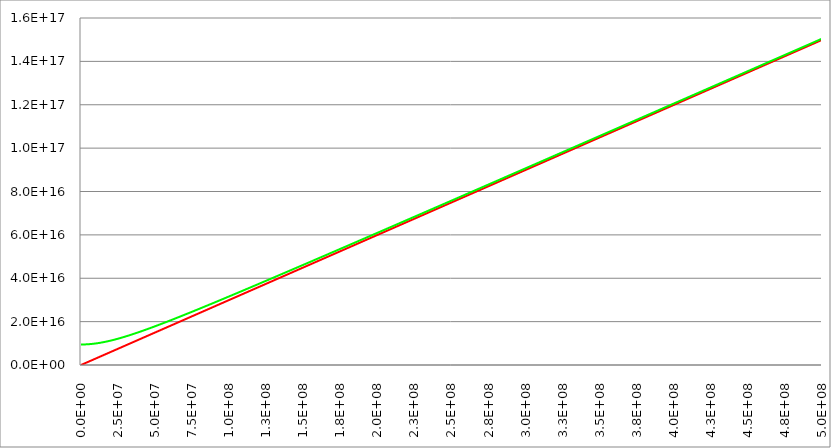
| Category | Series 1 | Series 0 | Series 2 |
|---|---|---|---|
| 0.0 | 0 | 9460730472580800 |  |
| 250000.0 | 74948114500000 | 9461036717467600 |  |
| 500000.0 | 149896229000000 | 9461955390777870 |  |
| 750000.0 | 224844343500000 | 9463486308522600 |  |
| 1000000.0 | 299792458000000 | 9465629164258070 |  |
| 1250000.0 | 374740572500000 | 9468383529392360 |  |
| 1500000.0 | 449688687000000 | 9471748853613310 |  |
| 1750000.0 | 524636801500000 | 9475724465437220 |  |
| 2000000.0 | 599584916000000 | 9480309572876750 |  |
| 2250000.0 | 674533030500000 | 9485503264226620 |  |
| 2500000.0 | 749481145000000 | 9491304508965320 |  |
| 2750000.0 | 824429259500000 | 9497712158770600 |  |
| 3000000.0 | 899377374000000 | 9504724948646660 |  |
| 3250000.0 | 974325488500000 | 9512341498160190 |  |
| 3500000.0 | 1049273603000000 | 9520560312782780 |  |
| 3750000.0 | 1124221717500000 | 9529379785336470 |  |
| 4000000.0 | 1199169832000000 | 9538798197539280 |  |
| 4250000.0 | 1274117946500000 | 9548813721647360 |  |
| 4500000.0 | 1349066061000000 | 9559424422190130 |  |
| 4750000.0 | 1424014175500000 | 9570628257794670 |  |
| 5000000.0 | 1498962290000000 | 9582423083095420 |  |
| 5250000.0 | 1573910404500000 | 9594806650725210 |  |
| 5500000.0 | 1648858519000000 | 9607776613383340 |  |
| 5750000.0 | 1723806633500000 | 9621330525976560 |  |
| 6000000.0 | 1798754748000000 | 9635465847828500 |  |
| 6250000.0 | 1873702862500000 | 9650179944953110 |  |
| 6500000.0 | 1948650977000000 | 9665470092387610 |  |
| 6750000.0 | 2023599091500000 | 9681333476580410 |  |
| 7000000.0 | 2098547206000000 | 9697767197829400 |  |
| 7250000.0 | 2173495320500000 | 9714768272765950 |  |
| 7500000.0 | 2248443435000000 | 9732333636880120 |  |
| 7750000.0 | 2323391549500000 | 9750460147082410 |  |
| 8000000.0 | 2398339664000000 | 9769144584297470 |  |
| 8250000.0 | 2473287778500000 | 9788383656085250 |  |
| 8500000.0 | 2548235893000000 | 9808173999285140 |  |
| 8750000.0 | 2623184007500000 | 9828512182678670 |  |
| 9000000.0 | 2698132122000000 | 9849394709666280 |  |
| 9250000.0 | 2773080236500000 | 9870818020954180 |  |
| 9500000.0 | 2848028351000000 | 9892778497246840 |  |
| 9750000.0 | 2922976465500000 | 9915272461941190 |  |
| 10000000.0 | 2997924580000000 | 9938296183818580 |  |
| 10250000.0 | 3072872694500000 | 9961845879730630 |  |
| 10500000.0 | 3147820809000000 | 9985917717275190 |  |
| 10750000.0 | 3222768923500000 | 10010507817459000 |  |
| 11000000.0 | 3297717038000000 | 10035612257343500 |  |
| 11250000.0 | 3372665152500000 | 10061227072670300 |  |
| 11500000.0 | 3447613267000000 | 10087348260463800 |  |
| 11750000.0 | 3522561381500000 | 10113971781607100 |  |
| 12000000.0 | 3597509496000000 | 10141093563389100 |  |
| 12250000.0 | 3672457610500000 | 10168709502019300 |  |
| 12500000.0 | 3747405725000000 | 10196815465109200 |  |
| 12750000.0 | 3822353839500000 | 10225407294115600 |  |
| 13000000.0 | 3897301954000000 | 10254480806746500 |  |
| 13250000.0 | 3972250068500000 | 10284031799324600 |  |
| 13500000.0 | 4047198183000000 | 10314056049108800 |  |
| 13750000.0 | 4122146297500000 | 10344549316570700 |  |
| 14000000.0 | 4197094412000000 | 10375507347624500 |  |
| 14250000.0 | 4272042526500000 | 10406925875810300 |  |
| 14500000.0 | 4346990641000000 | 10438800624426800 |  |
| 14750000.0 | 4421938755500000 | 10471127308615100 |  |
| 15000000.0 | 4496886870000000 | 10503901637390800 |  |
| 15250000.0 | 4571834984500000 | 10537119315623800 |  |
| 15500000.0 | 4646783099000000 | 10570776045966000 |  |
| 15750000.0 | 4721731213500000 | 10604867530724500 |  |
| 16000000.0 | 4796679328000000 | 10639389473682000 |  |
| 16250000.0 | 4871627442500000 | 10674337581861900 |  |
| 16500000.0 | 4946575557000000 | 10709707567239600 |  |
| 16750000.0 | 5021523671500000 | 10745495148398300 |  |
| 17000000.0 | 5096471786000000 | 10781696052130900 |  |
| 17250000.0 | 5171419900500000 | 10818306014986400 |  |
| 17500000.0 | 5246368015000000 | 10855320784762200 |  |
| 17750000.0 | 5321316129500000 | 10892736121941700 |  |
| 18000000.0 | 5396264244000000 | 10930547801078200 |  |
| 18250000.0 | 5471212358500000 | 10968751612125100 |  |
| 18500000.0 | 5546160473000000 | 11007343361712800 |  |
| 18750000.0 | 5621108587500000 | 11046318874373100 |  |
| 19000000.0 | 5696056702000000 | 11085673993711600 |  |
| 19250000.0 | 5771004816500000 | 11125404583529000 |  |
| 19500000.0 | 5845952931000000 | 11165506528891300 |  |
| 19750000.0 | 5920901045500000 | 11205975737150500 |  |
| 20000000.0 | 5995849160000000 | 11246808138916300 |  |
| 20250000.0 | 6070797274500000 | 11287999688979800 |  |
| 20500000.0 | 6145745389000000 | 11329546367189400 |  |
| 20750000.0 | 6220693503500000 | 11371444179281000 |  |
| 21000000.0 | 6295641618000000 | 11413689157662500 |  |
| 21250000.0 | 6370589732500000 | 11456277362154000 |  |
| 21500000.0 | 6445537847000000 | 11499204880685000 |  |
| 21750000.0 | 6520485961500000 | 11542467829948300 |  |
| 22000000.0 | 6595434076000000 | 11586062356014000 |  |
| 22250000.0 | 6670382190500000 | 11629984634902400 |  |
| 22500000.0 | 6745330305000000 | 11674230873117500 |  |
| 22750000.0 | 6820278419500000 | 11718797308143500 |  |
| 23000000.0 | 6895226534000000 | 11763680208903200 |  |
| 23250000.0 | 6970174648500000 | 11808875876181300 |  |
| 23500000.0 | 7045122763000000 | 11854380643012100 |  |
| 23750000.0 | 7120070877500000 | 11900190875034500 |  |
| 24000000.0 | 7195018992000000 | 11946302970813300 |  |
| 24250000.0 | 7269967106500000 | 11992713362129200 |  |
| 24500000.0 | 7344915221000000 | 12039418514238900 |  |
| 24750000.0 | 7419863335500000 | 12086414926104400 |  |
| 25000000.0 | 7494811450000000 | 12133699130595400 |  |
| 25250000.0 | 7569759564500000 | 12181267694663000 |  |
| 25500000.0 | 7644707679000000 | 12229117219487500 |  |
| 25750000.0 | 7719655793500000 | 12277244340600800 |  |
| 26000000.0 | 7794603908000000 | 12325645727984500 |  |
| 26250000.0 | 7869552022500000 | 12374318086144000 |  |
| 26500000.0 | 7944500137000000 | 12423258154160300 |  |
| 26750000.0 | 8019448251500000 | 12472462705720900 |  |
| 27000000.0 | 8094396366000000 | 12521928549128700 |  |
| 27250000.0 | 8169344480500000 | 12571652527292400 |  |
| 27500000.0 | 8244292595000000 | 12621631517697000 |  |
| 27750000.0 | 8319240709500000 | 12671862432356700 |  |
| 28000000.0 | 8394188824000000 | 12722342217750500 |  |
| 28250000.0 | 8469136938500000 | 12773067854741500 |  |
| 28500000.0 | 8544085053000000 | 12824036358480000 |  |
| 28750000.0 | 8619033167500000 | 12875244778292400 |  |
| 29000000.0 | 8693981282000000 | 12926690197555600 |  |
| 29250000.0 | 8768929396500000 | 12978369733558000 |  |
| 29500000.0 | 8843877511000000 | 13030280537348000 |  |
| 29750000.0 | 8918825625500000 | 13082419793570200 |  |
| 30000000.0 | 8993773740000000 | 13134784720290300 |  |
| 30250000.0 | 9068721854500000 | 13187372568809500 |  |
| 30500000.0 | 9143669969000000 | 13240180623468900 |  |
| 30750000.0 | 9218618083500000 | 13293206201443500 |  |
| 31000000.0 | 9293566198000000 | 13346446652528600 |  |
| 31250000.0 | 9368514312500000 | 13399899358916900 |  |
| 31500000.0 | 9443462427000000 | 13453561734968100 |  |
| 31750000.0 | 9518410541500000 | 13507431226971400 |  |
| 32000000.0 | 9593358656000000 | 13561505312900400 |  |
| 32250000.0 | 9668306770500000 | 13615781502163300 |  |
| 32500000.0 | 9743254885000000 | 13670257335345300 |  |
| 32750000.0 | 9818202999500000 | 13724930383947000 |  |
| 33000000.0 | 9893151114000000 | 13779798250117700 |  |
| 33250000.0 | 9968099228500000 | 13834858566383300 |  |
| 33500000.0 | 10043047343000000 | 13890108995371200 |  |
| 33750000.0 | 10117995457500000 | 13945547229530400 |  |
| 34000000.0 | 10192943572000000 | 14001170990849100 |  |
| 34250000.0 | 10267891686500000 | 14056978030568600 |  |
| 34500000.0 | 10342839801000000 | 14112966128894800 |  |
| 34750000.0 | 10417787915500000 | 14169133094707300 |  |
| 35000000.0 | 10492736030000000 | 14225476765266500 |  |
| 35250000.0 | 10567684144500000 | 14281995005918500 |  |
| 35500000.0 | 10642632259000000 | 14338685709798900 |  |
| 35750000.0 | 10717580373500000 | 14395546797535700 |  |
| 36000000.0 | 10792528488000000 | 14452576216949900 |  |
| 36250000.0 | 10867476602500000 | 14509771942757100 |  |
| 36500000.0 | 10942424717000000 | 14567131976267300 |  |
| 36750000.0 | 11017372831500000 | 14624654345084800 |  |
| 37000000.0 | 11092320946000000 | 14682337102808300 |  |
| 37250000.0 | 11167269060500000 | 14740178328730900 |  |
| 37500000.0 | 11242217175000000 | 14798176127540000 |  |
| 37750000.0 | 11317165289500000 | 14856328629018600 |  |
| 38000000.0 | 11392113404000000 | 14914633987746500 |  |
| 38250000.0 | 11467061518500000 | 14973090382802500 |  |
| 38500000.0 | 11542009633000000 | 15031696017467700 |  |
| 38750000.0 | 11616957747500000 | 15090449118929800 |  |
| 39000000.0 | 11691905862000000 | 15149347937988800 |  |
| 39250000.0 | 11766853976500000 | 15208390748763700 |  |
| 39500000.0 | 11841802091000000 | 15267575848401200 |  |
| 39750000.0 | 11916750205500000 | 15326901556785500 |  |
| 40000000.0 | 11991698320000000 | 15386366216250100 |  |
| 40250000.0 | 12066646434500000 | 15445968191291400 |  |
| 40500000.0 | 12141594549000000 | 15505705868284000 |  |
| 40750000.0 | 12216542663500000 | 15565577655198200 |  |
| 41000000.0 | 12291490778000000 | 15625581981319400 |  |
| 41250000.0 | 12366438892500000 | 15685717296969700 |  |
| 41500000.0 | 12441387007000000 | 15745982073231600 |  |
| 41750000.0 | 12516335121500000 | 15806374801674200 |  |
| 42000000.0 | 12591283236000000 | 15866893994081400 |  |
| 42250000.0 | 12666231350500000 | 15927538182182600 |  |
| 42500000.0 | 12741179465000000 | 15988305917386000 |  |
| 42750000.0 | 12816127579500000 | 16049195770514200 |  |
| 43000000.0 | 12891075694000000 | 16110206331542100 |  |
| 43250000.0 | 12966023808500000 | 16171336209337700 |  |
| 43500000.0 | 13040971923000000 | 16232584031405500 |  |
| 43750000.0 | 13115920037500000 | 16293948443631900 |  |
| 44000000.0 | 13190868152000000 | 16355428110034100 |  |
| 44250000.0 | 13265816266500000 | 16417021712510800 |  |
| 44500000.0 | 13340764381000000 | 16478727950596300 |  |
| 44750000.0 | 13415712495500000 | 16540545541216900 |  |
| 45000000.0 | 13490660610000000 | 16602473218449600 |  |
| 45250000.0 | 13565608724500000 | 16664509733284900 |  |
| 45500000.0 | 13640556839000000 | 16726653853390400 |  |
| 45750000.0 | 13715504953500000 | 16788904362878500 |  |
| 46000000.0 | 13790453068000000 | 16851260062076800 |  |
| 46250000.0 | 13865401182500000 | 16913719767300200 |  |
| 46500000.0 | 13940349297000000 | 16976282310626600 |  |
| 46750000.0 | 14015297411500000 | 17038946539675600 |  |
| 47000000.0 | 14090245526000000 | 17101711317388700 |  |
| 47250000.0 | 14165193640500000 | 17164575521813200 |  |
| 47500000.0 | 14240141755000000 | 17227538045889000 |  |
| 47750000.0 | 14315089869500000 | 17290597797237000 |  |
| 48000000.0 | 14390037984000000 | 17353753697951200 |  |
| 48250000.0 | 14464986098500000 | 17417004684392900 |  |
| 48500000.0 | 14539934213000000 | 17480349706988200 |  |
| 48750000.0 | 14614882327500000 | 17543787730027200 |  |
| 49000000.0 | 14689830442000000 | 17607317731466800 |  |
| 49250000.0 | 14764778556500000 | 17670938702735500 |  |
| 49500000.0 | 14839726671000000 | 17734649648540800 |  |
| 49750000.0 | 14914674785500000 | 17798449586679700 |  |
| 50000000.0 | 14989622900000000 | 17862337547851400 |  |
| 50250000.0 | 15064571014500000 | 17926312575472500 |  |
| 50500000.0 | 15139519129000000 | 17990373725494400 |  |
| 50750000.0 | 15214467243500000 | 18054520066224600 |  |
| 51000000.0 | 15289415358000000 | 18118750678148500 |  |
| 51250000.0 | 15364363472500000 | 18183064653755100 |  |
| 51500000.0 | 15439311587000000 | 18247461097364700 |  |
| 51750000.0 | 15514259701500000 | 18311939124959000 |  |
| 52000000.0 | 15589207816000000 | 18376497864013400 |  |
| 52250000.0 | 15664155930500000 | 18441136453332100 |  |
| 52500000.0 | 15739104045000000 | 18505854042885300 |  |
| 52750000.0 | 15814052159500000 | 18570649793648500 |  |
| 53000000.0 | 15889000274000000 | 18635522877444500 |  |
| 53250000.0 | 15963948388500000 | 18700472476787600 |  |
| 53500000.0 | 16038896503000000 | 18765497784729700 |  |
| 53750000.0 | 16113844617500000 | 18830598004708800 |  |
| 54000000.0 | 16188792732000000 | 18895772350400300 |  |
| 54250000.0 | 16263740846500000 | 18961020045569100 |  |
| 54500000.0 | 16338688961000000 | 19026340323925400 |  |
| 54750000.0 | 16413637075500000 | 19091732428981600 |  |
| 55000000.0 | 16488585190000000 | 19157195613911200 |  |
| 55250000.0 | 16563533304500000 | 19222729141410900 |  |
| 55500000.0 | 16638481419000000 | 19288332283563300 |  |
| 55750000.0 | 16713429533500000 | 19354004321702800 |  |
| 56000000.0 | 16788377648000000 | 19419744546282500 |  |
| 56250000.0 | 16863325762500000 | 19485552256743900 |  |
| 56500000.0 | 16938273877000000 | 19551426761388300 |  |
| 56750000.0 | 17013221991500000 | 19617367377249400 |  |
| 57000000.0 | 17088170106000000 | 19683373429969100 |  |
| 57250000.0 | 17163118220500000 | 19749444253674100 |  |
| 57500000.0 | 17238066335000000 | 19815579190854500 |  |
| 57750000.0 | 17313014449500000 | 19881777592244900 |  |
| 58000000.0 | 17387962564000000 | 19948038816706400 |  |
| 58250000.0 | 17462910678500000 | 20014362231110800 |  |
| 58500000.0 | 17537858793000000 | 20080747210226800 |  |
| 58750000.0 | 17612806907500000 | 20147193136607100 |  |
| 59000000.0 | 17687755022000000 | 20213699400478300 |  |
| 59250000.0 | 17762703136500000 | 20280265399631200 |  |
| 59500000.0 | 17837651251000000 | 20346890539314000 |  |
| 59750000.0 | 17912599365500000 | 20413574232126400 |  |
| 60000000.0 | 17987547480000000 | 20480315897915000 |  |
| 60250000.0 | 18062495594500000 | 20547114963671200 |  |
| 60500000.0 | 18137443709000000 | 20613970863430100 |  |
| 60750000.0 | 18212391823500000 | 20680883038170700 |  |
| 61000000.0 | 18287339938000000 | 20747850935718200 |  |
| 61250000.0 | 18362288052500000 | 20814874010647300 |  |
| 61500000.0 | 18437236167000000 | 20881951724187000 |  |
| 61750000.0 | 18512184281500000 | 20949083544127300 |  |
| 62000000.0 | 18587132396000000 | 21016268944727000 |  |
| 62250000.0 | 18662080510500000 | 21083507406622500 |  |
| 62500000.0 | 18737028625000000 | 21150798416738600 |  |
| 62750000.0 | 18811976739500000 | 21218141468200800 |  |
| 63000000.0 | 18886924854000000 | 21285536060247700 |  |
| 63250000.0 | 18961872968500000 | 21352981698146500 |  |
| 63500000.0 | 19036821083000000 | 21420477893108400 |  |
| 63750000.0 | 19111769197500000 | 21488024162205600 |  |
| 64000000.0 | 19186717312000000 | 21555620028290300 |  |
| 64250000.0 | 19261665426500000 | 21623265019913500 |  |
| 64500000.0 | 19336613541000000 | 21690958671246900 |  |
| 64750000.0 | 19411561655500000 | 21758700522004100 |  |
| 65000000.0 | 19486509770000000 | 21826490117364200 |  |
| 65250000.0 | 19561457884500000 | 21894327007896200 |  |
| 65500000.0 | 19636405999000000 | 21962210749484700 |  |
| 65750000.0 | 19711354113500000 | 22030140903256200 |  |
| 66000000.0 | 19786302228000000 | 22098117035507300 |  |
| 66250000.0 | 19861250342500000 | 22166138717633300 |  |
| 66500000.0 | 19936198457000000 | 22234205526058400 |  |
| 66750000.0 | 20011146571500000 | 22302317042166700 |  |
| 67000000.0 | 20086094686000000 | 22370472852233900 |  |
| 67250000.0 | 20161042800500000 | 22438672547360900 |  |
| 67500000.0 | 20235990915000000 | 22506915723407600 |  |
| 67750000.0 | 20310939029500000 | 22575201980928200 |  |
| 68000000.0 | 20385887144000000 | 22643530925107100 |  |
| 68250000.0 | 20460835258500000 | 22711902165695900 |  |
| 68500000.0 | 20535783373000000 | 22780315316951800 |  |
| 68750000.0 | 20610731487500000 | 22848769997575900 |  |
| 69000000.0 | 20685679602000000 | 22917265830653700 |  |
| 69250000.0 | 20760627716500000 | 22985802443595200 |  |
| 69500000.0 | 20835575831000000 | 23054379468077200 |  |
| 69750000.0 | 20910523945500000 | 23122996539985300 |  |
| 70000000.0 | 20985472060000000 | 23191653299357400 |  |
| 70250000.0 | 21060420174500000 | 23260349390328300 |  |
| 70500000.0 | 21135368289000000 | 23329084461074200 |  |
| 70750000.0 | 21210316403500000 | 23397858163758800 |  |
| 71000000.0 | 21285264518000000 | 23466670154480400 |  |
| 71250000.0 | 21360212632500000 | 23535520093218600 |  |
| 71500000.0 | 21435160747000000 | 23604407643783400 |  |
| 71750000.0 | 21510108861500000 | 23673332473763600 |  |
| 72000000.0 | 21585056976000000 | 23742294254476900 |  |
| 72250000.0 | 21660005090500000 | 23811292660920500 |  |
| 72500000.0 | 21734953205000000 | 23880327371722200 |  |
| 72750000.0 | 21809901319500000 | 23949398069092800 |  |
| 73000000.0 | 21884849434000000 | 24018504438778100 |  |
| 73250000.0 | 21959797548500000 | 24087646170013200 |  |
| 73500000.0 | 22034745663000000 | 24156822955475900 |  |
| 73750000.0 | 22109693777500000 | 24226034491241900 |  |
| 74000000.0 | 22184641892000000 | 24295280476740100 |  |
| 74250000.0 | 22259590006500000 | 24364560614708800 |  |
| 74500000.0 | 22334538121000000 | 24433874611152400 |  |
| 74750000.0 | 22409486235500000 | 24503222175298800 |  |
| 75000000.0 | 22484434350000000 | 24572603019557600 |  |
| 75250000.0 | 22559382464500000 | 24642016859478300 |  |
| 75500000.0 | 22634330579000000 | 24711463413710300 |  |
| 75750000.0 | 22709278693500000 | 24780942403961900 |  |
| 76000000.0 | 22784226808000000 | 24850453554961500 |  |
| 76250000.0 | 22859174922500000 | 24919996594418000 |  |
| 76500000.0 | 22934123037000000 | 24989571252982800 |  |
| 76750000.0 | 23009071151500000 | 25059177264211700 |  |
| 77000000.0 | 23084019266000000 | 25128814364527900 |  |
| 77250000.0 | 23158967380500000 | 25198482293184900 |  |
| 77500000.0 | 23233915495000000 | 25268180792230400 |  |
| 77750000.0 | 23308863609500000 | 25337909606470600 |  |
| 78000000.0 | 23383811724000000 | 25407668483435400 |  |
| 78250000.0 | 23458759838500000 | 25477457173342900 |  |
| 78500000.0 | 23533707953000000 | 25547275429066000 |  |
| 78750000.0 | 23608656067500000 | 25617123006098300 |  |
| 79000000.0 | 23683604182000000 | 25686999662521200 |  |
| 79250000.0 | 23758552296500000 | 25756905158970900 |  |
| 79500000.0 | 23833500411000000 | 25826839258606400 |  |
| 79750000.0 | 23908448525500000 | 25896801727077400 |  |
| 80000000.0 | 23983396640000000 | 25966792332493400 |  |
| 80250000.0 | 24058344754500000 | 26036810845392700 |  |
| 80500000.0 | 24133292869000000 | 26106857038711700 |  |
| 80750000.0 | 24208240983500000 | 26176930687755100 |  |
| 81000000.0 | 24283189098000000 | 26247031570166400 |  |
| 81250000.0 | 24358137212500000 | 26317159465898800 |  |
| 81500000.0 | 24433085327000000 | 26387314157186200 |  |
| 81750000.0 | 24508033441500000 | 26457495428514900 |  |
| 82000000.0 | 24582981556000000 | 26527703066596100 |  |
| 82250000.0 | 24657929670500000 | 26597936860337900 |  |
| 82500000.0 | 24732877785000000 | 26668196600818400 |  |
| 82750000.0 | 24807825899500000 | 26738482081258800 |  |
| 83000000.0 | 24882774014000000 | 26808793096997200 |  |
| 83250000.0 | 24957722128500000 | 26879129445462600 |  |
| 83500000.0 | 25032670243000000 | 26949490926148900 |  |
| 83750000.0 | 25107618357500000 | 27019877340590200 |  |
| 84000000.0 | 25182566472000000 | 27090288492335300 |  |
| 84250000.0 | 25257514586500000 | 27160724186923600 |  |
| 84500000.0 | 25332462701000000 | 27231184231860600 |  |
| 84750000.0 | 25407410815500000 | 27301668436594000 |  |
| 85000000.0 | 25482358930000000 | 27372176612490300 |  |
| 85250000.0 | 25557307044500000 | 27442708572811300 |  |
| 85500000.0 | 25632255159000000 | 27513264132691800 |  |
| 85750000.0 | 25707203273500000 | 27583843109116100 |  |
| 86000000.0 | 25782151388000000 | 27654445320896400 |  |
| 86250000.0 | 25857099502500000 | 27725070588650700 |  |
| 86500000.0 | 25932047617000000 | 27795718734781100 |  |
| 86750000.0 | 26006995731500000 | 27866389583452200 |  |
| 87000000.0 | 26081943846000000 | 27937082960570400 |  |
| 87250000.0 | 26156891960500000 | 28007798693762800 |  |
| 87500000.0 | 26231840075000000 | 28078536612357100 |  |
| 87750000.0 | 26306788189500000 | 28149296547360900 |  |
| 88000000.0 | 26381736304000000 | 28220078331442200 |  |
| 88250000.0 | 26456684418500000 | 28290881798909300 |  |
| 88500000.0 | 26531632533000000 | 28361706785691900 |  |
| 88750000.0 | 26606580647500000 | 28432553129321400 |  |
| 89000000.0 | 26681528762000000 | 28503420668912600 |  |
| 89250000.0 | 26756476876500000 | 28574309245144700 |  |
| 89500000.0 | 26831424991000000 | 28645218700243100 |  |
| 89750000.0 | 26906373105500000 | 28716148877961100 |  |
| 90000000.0 | 26981321220000000 | 28787099623562200 |  |
| 90250000.0 | 27056269334500000 | 28858070783802600 |  |
| 90500000.0 | 27131217449000000 | 28929062206913500 |  |
| 90750000.0 | 27206165563500000 | 29000073742584100 |  |
| 91000000.0 | 27281113678000000 | 29071105241944700 |  |
| 91250000.0 | 27356061792500000 | 29142156557549900 |  |
| 91500000.0 | 27431009907000000 | 29213227543362200 |  |
| 91750000.0 | 27505958021500000 | 29284318054735700 |  |
| 92000000.0 | 27580906136000000 | 29355427948400200 |  |
| 92250000.0 | 27655854250500000 | 29426557082445100 |  |
| 92500000.0 | 27730802365000000 | 29497705316304100 |  |
| 92750000.0 | 27805750479500000 | 29568872510739600 |  |
| 93000000.0 | 27880698594000000 | 29640058527827500 |  |
| 93250000.0 | 27955646708500000 | 29711263230942200 |  |
| 93500000.0 | 28030594823000000 | 29782486484742000 |  |
| 93750000.0 | 28105542937500000 | 29853728155154100 |  |
| 94000000.0 | 28180491052000000 | 29924988109360600 |  |
| 94250000.0 | 28255439166500000 | 29996266215784000 |  |
| 94500000.0 | 28330387281000000 | 30067562344073300 |  |
| 94750000.0 | 28405335395500000 | 30138876365090200 |  |
| 95000000.0 | 28480283510000000 | 30210208150895000 |  |
| 95250000.0 | 28555231624500000 | 30281557574733700 |  |
| 95500000.0 | 28630179739000000 | 30352924511024500 |  |
| 95750000.0 | 28705127853500000 | 30424308835344300 |  |
| 96000000.0 | 28780075968000000 | 30495710424416100 |  |
| 96250000.0 | 28855024082500000 | 30567129156096200 |  |
| 96500000.0 | 28929972197000000 | 30638564909361400 |  |
| 96750000.0 | 29004920311500000 | 30710017564296600 |  |
| 97000000.0 | 29079868426000000 | 30781487002082300 |  |
| 97250000.0 | 29154816540500000 | 30852973104982900 |  |
| 97500000.0 | 29229764655000000 | 30924475756334200 |  |
| 97750000.0 | 29304712769500000 | 30995994840531800 |  |
| 98000000.0 | 29379660884000000 | 31067530243019600 |  |
| 98250000.0 | 29454608998500000 | 31139081850277700 |  |
| 98500000.0 | 29529557113000000 | 31210649549811700 |  |
| 98750000.0 | 29604505227500000 | 31282233230140800 |  |
| 99000000.0 | 29679453342000000 | 31353832780787300 |  |
| 99250000.0 | 29754401456500000 | 31425448092265000 |  |
| 99500000.0 | 29829349571000000 | 31497079056069000 |  |
| 99750000.0 | 29904297685500000 | 31568725564664600 |  |
| 100000000.0 | 29979245800000000 | 31640387511476900 |  |
| 100250000.0 | 30054193914500000 | 31712064790880400 |  |
| 100500000.0 | 30129142029000000 | 31783757298188500 |  |
| 100750000.0 | 30204090143500000 | 31855464929643800 |  |
| 101000000.0 | 30279038258000000 | 31927187582407600 |  |
| 101250000.0 | 30353986372500000 | 31998925154550200 |  |
| 101500000.0 | 30428934487000000 | 32070677545041200 |  |
| 101750000.0 | 30503882601500000 | 32142444653739800 |  |
| 102000000.0 | 30578830716000000 | 32214226381385100 |  |
| 102250000.0 | 30653778830500000 | 32286022629586800 |  |
| 102500000.0 | 30728726945000000 | 32357833300816100 |  |
| 102750000.0 | 30803675059500000 | 32429658298396100 |  |
| 103000000.0 | 30878623174000000 | 32501497526493200 |  |
| 103250000.0 | 30953571288500000 | 32573350890107800 |  |
| 103500000.0 | 31028519403000000 | 32645218295065500 |  |
| 103750000.0 | 31103467517500000 | 32717099648008600 |  |
| 104000000.0 | 31178415632000000 | 32788994856387200 |  |
| 104250000.0 | 31253363746500000 | 32860903828450800 |  |
| 104500000.0 | 31328311861000000 | 32932826473239800 |  |
| 104750000.0 | 31403259975500000 | 33004762700577600 |  |
| 105000000.0 | 31478208090000000 | 33076712421061500 |  |
| 105250000.0 | 31553156204500000 | 33148675546055800 |  |
| 105500000.0 | 31628104319000000 | 33220651987682500 |  |
| 105750000.0 | 31703052433500000 | 33292641658814400 |  |
| 106000000.0 | 31778000548000000 | 33364644473067000 |  |
| 106250000.0 | 31852948662500000 | 33436660344790200 |  |
| 106500000.0 | 31927896777000000 | 33508689189061800 |  |
| 106750000.0 | 32002844891500000 | 33580730921678800 |  |
| 107000000.0 | 32077793006000000 | 33652785459150700 |  |
| 107250000.0 | 32152741120500000 | 33724852718691900 |  |
| 107500000.0 | 32227689235000000 | 33796932618214600 |  |
| 107750000.0 | 32302637349500000 | 33869025076321400 |  |
| 108000000.0 | 32377585464000000 | 33941130012298100 |  |
| 108250000.0 | 32452533578500000 | 34013247346107100 |  |
| 108500000.0 | 32527481693000000 | 34085376998380400 |  |
| 108750000.0 | 32602429807500000 | 34157518890412300 |  |
| 109000000.0 | 32677377922000000 | 34229672944153300 |  |
| 109250000.0 | 32752326036500000 | 34301839082202900 |  |
| 109500000.0 | 32827274151000000 | 34374017227803300 |  |
| 109750000.0 | 32902222265500000 | 34446207304832600 |  |
| 110000000.0 | 32977170380000000 | 34518409237799000 |  |
| 110250000.0 | 33052118494500000 | 34590622951833500 |  |
| 110500000.0 | 33127066609000000 | 34662848372684300 |  |
| 110750000.0 | 33202014723500000 | 34735085426710400 |  |
| 111000000.0 | 33276962838000000 | 34807334040875500 |  |
| 111250000.0 | 33351910952500000 | 34879594142741600 |  |
| 111500000.0 | 33426859067000000 | 34951865660463600 |  |
| 111750000.0 | 33501807181500000 | 35024148522782900 |  |
| 112000000.0 | 33576755296000000 | 35096442659021600 |  |
| 112250000.0 | 33651703410500000 | 35168747999077000 |  |
| 112500000.0 | 33726651525000000 | 35241064473415600 |  |
| 112750000.0 | 33801599639500000 | 35313392013067400 |  |
| 113000000.0 | 33876547754000000 | 35385730549620600 |  |
| 113250000.0 | 33951495868500000 | 35458080015215800 |  |
| 113500000.0 | 34026443983000000 | 35530440342540800 |  |
| 113750000.0 | 34101392097500000 | 35602811464824900 |  |
| 114000000.0 | 34176340212000000 | 35675193315833900 |  |
| 114250000.0 | 34251288326500000 | 35747585829864300 |  |
| 114500000.0 | 34326236441000000 | 35819988941738900 |  |
| 114750000.0 | 34401184555500000 | 35892402586800800 |  |
| 115000000.0 | 34476132670000000 | 35964826700909000 |  |
| 115250000.0 | 34551080784500000 | 36037261220432896 |  |
| 115500000.0 | 34626028899000000 | 36109706082247400 |  |
| 115750000.0 | 34700977013500000 | 36182161223728304 |  |
| 116000000.0 | 34775925128000000 | 36254626582747000 |  |
| 116250000.0 | 34850873242500000 | 36327102097666000 |  |
| 116500000.0 | 34925821357000000 | 36399587707334096 |  |
| 116750000.0 | 35000769471500000 | 36472083351081400 |  |
| 117000000.0 | 35075717586000000 | 36544588968715104 |  |
| 117250000.0 | 35150665700500000 | 36617104500514800 |  |
| 117500000.0 | 35225613815000000 | 36689629887227600 |  |
| 117750000.0 | 35300561929500000 | 36762165070064096 |  |
| 118000000.0 | 35375510044000000 | 36834709990693504 |  |
| 118250000.0 | 35450458158500000 | 36907264591239800 |  |
| 118500000.0 | 35525406273000000 | 36979828814276704 |  |
| 118750000.0 | 35600354387500000 | 37052402602824096 |  |
| 119000000.0 | 35675302502000000 | 37124985900343200 |  |
| 119250000.0 | 35750250616500000 | 37197578650732704 |  |
| 119500000.0 | 35825198731000000 | 37270180798324400 |  |
| 119750000.0 | 35900146845500000 | 37342792287879504 |  |
| 120000000.0 | 35975094960000000 | 37415413064584096 |  |
| 120250000.0 | 36050043074500000 | 37488043074045200 |  |
| 120500000.0 | 36124991189000000 | 37560682262287200 |  |
| 120750000.0 | 36199939303500000 | 37633330575747504 |  |
| 121000000.0 | 36274887418000000 | 37705987961272896 |  |
| 121250000.0 | 36349835532500000 | 37778654366115400 |  |
| 121500000.0 | 36424783647000000 | 37851329737929000 |  |
| 121750000.0 | 36499731761500000 | 37924014024765296 |  |
| 122000000.0 | 36574679876000000 | 37996707175070400 |  |
| 122250000.0 | 36649627990500000 | 38069409137680600 |  |
| 122500000.0 | 36724576105000000 | 38142119861819504 |  |
| 122750000.0 | 36799524219500000 | 38214839297093504 |  |
| 123000000.0 | 36874472334000000 | 38287567393489104 |  |
| 123250000.0 | 36949420448500000 | 38360304101369104 |  |
| 123500000.0 | 37024368563000000 | 38433049371468704 |  |
| 123750000.0 | 37099316677500000 | 38505803154892896 |  |
| 124000000.0 | 37174264792000000 | 38578565403112200 |  |
| 124250000.0 | 37249212906500000 | 38651336067959800 |  |
| 124500000.0 | 37324161021000000 | 38724115101628400 |  |
| 124750000.0 | 37399109135500000 | 38796902456666304 |  |
| 125000000.0 | 37474057250000000 | 38869698085974600 |  |
| 125250000.0 | 37549005364500000 | 38942501942804000 |  |
| 125500000.0 | 37623953479000000 | 39015313980751296 |  |
| 125750000.0 | 37698901593500000 | 39088134153756704 |  |
| 126000000.0 | 37773849708000000 | 39160962416100096 |  |
| 126250000.0 | 37848797822500000 | 39233798722398600 |  |
| 126500000.0 | 37923745937000000 | 39306643027603000 |  |
| 126750000.0 | 37998694051500000 | 39379495286995200 |  |
| 127000000.0 | 38073642166000000 | 39452355456184704 |  |
| 127250000.0 | 38148590280500000 | 39525223491106096 |  |
| 127500000.0 | 38223538395000000 | 39598099348016096 |  |
| 127750000.0 | 38298486509500000 | 39670982983490200 |  |
| 128000000.0 | 38373434624000000 | 39743874354420496 |  |
| 128250000.0 | 38448382738500000 | 39816773418012304 |  |
| 128500000.0 | 38523330853000000 | 39889680131781600 |  |
| 128750000.0 | 38598278967500000 | 39962594453552304 |  |
| 129000000.0 | 38673227082000000 | 40035516341453200 |  |
| 129250000.0 | 38748175196500000 | 40108445753915800 |  |
| 129500000.0 | 38823123311000000 | 40181382649671000 |  |
| 129750000.0 | 38898071425500000 | 40254326987747000 |  |
| 130000000.0 | 38973019540000000 | 40327278727466304 |  |
| 130250000.0 | 39047967654500000 | 40400237828443200 |  |
| 130500000.0 | 39122915769000000 | 40473204250581296 |  |
| 130750000.0 | 39197863883500000 | 40546177954071000 |  |
| 131000000.0 | 39272811998000000 | 40619158899386496 |  |
| 131250000.0 | 39347760112500000 | 40692147047284096 |  |
| 131500000.0 | 39422708227000000 | 40765142358799104 |  |
| 131750000.0 | 39497656341500000 | 40838144795243696 |  |
| 132000000.0 | 39572604456000000 | 40911154318204200 |  |
| 132250000.0 | 39647552570500000 | 40984170889539104 |  |
| 132500000.0 | 39722500685000000 | 41057194471376496 |  |
| 132750000.0 | 39797448799500000 | 41130225026111400 |  |
| 133000000.0 | 39872396914000000 | 41203262516404200 |  |
| 133250000.0 | 39947345028500000 | 41276306905177504 |  |
| 133500000.0 | 40022293143000000 | 41349358155614496 |  |
| 133750000.0 | 40097241257500000 | 41422416231156496 |  |
| 134000000.0 | 40172189372000000 | 41495481095500496 |  |
| 134250000.0 | 40247137486500000 | 41568552712597296 |  |
| 134500000.0 | 40322085601000000 | 41641631046649200 |  |
| 134750000.0 | 40397033715500000 | 41714716062107696 |  |
| 135000000.0 | 40471981830000000 | 41787807723671600 |  |
| 135250000.0 | 40546929944500000 | 41860905996284800 |  |
| 135500000.0 | 40621878059000000 | 41934010845134000 |  |
| 135750000.0 | 40696826173500000 | 42007122235647104 |  |
| 136000000.0 | 40771774288000000 | 42080240133490496 |  |
| 136250000.0 | 40846722402500000 | 42153364504567696 |  |
| 136500000.0 | 40921670517000000 | 42226495315016896 |  |
| 136750000.0 | 40996618631500000 | 42299632531209000 |  |
| 137000000.0 | 41071566746000000 | 42372776119746000 |  |
| 137250000.0 | 41146514860500000 | 42445926047458600 |  |
| 137500000.0 | 41221462975000000 | 42519082281404400 |  |
| 137750000.0 | 41296411089500000 | 42592244788866304 |  |
| 138000000.0 | 41371359204000000 | 42665413537350096 |  |
| 138250000.0 | 41446307318500000 | 42738588494583104 |  |
| 138500000.0 | 41521255433000000 | 42811769628511800 |  |
| 138750000.0 | 41596203547500000 | 42884956907300400 |  |
| 139000000.0 | 41671151662000000 | 42958150299329000 |  |
| 139250000.0 | 41746099776500000 | 43031349773191200 |  |
| 139500000.0 | 41821047891000000 | 43104555297693400 |  |
| 139750000.0 | 41895996005500000 | 43177766841851904 |  |
| 140000000.0 | 41970944120000000 | 43250984374891904 |  |
| 140250000.0 | 42045892234500000 | 43324207866245504 |  |
| 140500000.0 | 42120840349000000 | 43397437285550000 |  |
| 140750000.0 | 42195788463500000 | 43470672602646304 |  |
| 141000000.0 | 42270736578000000 | 43543913787576896 |  |
| 141250000.0 | 42345684692500000 | 43617160810584600 |  |
| 141500000.0 | 42420632807000000 | 43690413642110896 |  |
| 141750000.0 | 42495580921500000 | 43763672252793904 |  |
| 142000000.0 | 42570529036000000 | 43836936613467200 |  |
| 142250000.0 | 42645477150500000 | 43910206695157800 |  |
| 142500000.0 | 42720425265000000 | 43983482469085104 |  |
| 142750000.0 | 42795373379500000 | 44056763906658800 |  |
| 143000000.0 | 42870321494000000 | 44130050979477600 |  |
| 143250000.0 | 42945269608500000 | 44203343659327696 |  |
| 143500000.0 | 43020217723000000 | 44276641918181104 |  |
| 143750000.0 | 43095165837500000 | 44349945728194096 |  |
| 144000000.0 | 43170113952000000 | 44423255061706200 |  |
| 144250000.0 | 43245062066500000 | 44496569891238000 |  |
| 144500000.0 | 43320010181000000 | 44569890189490096 |  |
| 144750000.0 | 43394958295500000 | 44643215929341696 |  |
| 145000000.0 | 43469906410000000 | 44716547083848896 |  |
| 145250000.0 | 43544854524500000 | 44789883626243504 |  |
| 145500000.0 | 43619802639000000 | 44863225529931600 |  |
| 145750000.0 | 43694750753500000 | 44936572768491904 |  |
| 146000000.0 | 43769698868000000 | 45009925315674496 |  |
| 146250000.0 | 43844646982500000 | 45083283145400000 |  |
| 146500000.0 | 43919595097000000 | 45156646231757000 |  |
| 146750000.0 | 43994543211500000 | 45230014549002096 |  |
| 147000000.0 | 44069491326000000 | 45303388071557400 |  |
| 147250000.0 | 44144439440500000 | 45376766774010000 |  |
| 147500000.0 | 44219387555000000 | 45450150631110304 |  |
| 147750000.0 | 44294335669500000 | 45523539617770800 |  |
| 148000000.0 | 44369283784000000 | 45596933709064704 |  |
| 148250000.0 | 44444231898500000 | 45670332880224800 |  |
| 148500000.0 | 44519180013000000 | 45743737106642200 |  |
| 148750000.0 | 44594128127500000 | 45817146363865000 |  |
| 149000000.0 | 44669076242000000 | 45890560627597104 |  |
| 149250000.0 | 44744024356500000 | 45963979873696800 |  |
| 149500000.0 | 44818972471000000 | 46037404078175904 |  |
| 149750000.0 | 44893920585500000 | 46110833217198400 |  |
| 150000000.0 | 44968868700000000 | 46184267267079104 |  |
| 150250000.0 | 45043816814500000 | 46257706204282704 |  |
| 150500000.0 | 45118764929000000 | 46331150005422304 |  |
| 150750000.0 | 45193713043500000 | 46404598647258704 |  |
| 151000000.0 | 45268661158000000 | 46478052106698704 |  |
| 151250000.0 | 45343609272500000 | 46551510360794704 |  |
| 151500000.0 | 45418557387000000 | 46624973386742600 |  |
| 151750000.0 | 45493505501500000 | 46698441161881504 |  |
| 152000000.0 | 45568453616000000 | 46771913663692400 |  |
| 152250000.0 | 45643401730500000 | 46845390869796800 |  |
| 152500000.0 | 45718349845000000 | 46918872757956000 |  |
| 152750000.0 | 45793297959500000 | 46992359306069600 |  |
| 153000000.0 | 45868246074000000 | 47065850492174896 |  |
| 153250000.0 | 45943194188500000 | 47139346294445696 |  |
| 153500000.0 | 46018142303000000 | 47212846691190896 |  |
| 153750000.0 | 46093090417500000 | 47286351660853904 |  |
| 154000000.0 | 46168038532000000 | 47359861182011504 |  |
| 154250000.0 | 46242986646500000 | 47433375233372600 |  |
| 154500000.0 | 46317934761000000 | 47506893793777600 |  |
| 154750000.0 | 46392882875500000 | 47580416842197000 |  |
| 155000000.0 | 46467830990000000 | 47653944357730704 |  |
| 155250000.0 | 46542779104500000 | 47727476319606896 |  |
| 155500000.0 | 46617727219000000 | 47801012707181000 |  |
| 155750000.0 | 46692675333500000 | 47874553499935104 |  |
| 156000000.0 | 46767623448000000 | 47948098677476400 |  |
| 156250000.0 | 46842571562500000 | 48021648219536800 |  |
| 156500000.0 | 46917519677000000 | 48095202105971400 |  |
| 156750000.0 | 46992467791500000 | 48168760316758304 |  |
| 157000000.0 | 47067415906000000 | 48242322831997104 |  |
| 157250000.0 | 47142364020500000 | 48315889631908200 |  |
| 157500000.0 | 47217312135000000 | 48389460696831696 |  |
| 157750000.0 | 47292260249500000 | 48463036007226896 |  |
| 158000000.0 | 47367208364000000 | 48536615543671104 |  |
| 158250000.0 | 47442156478500000 | 48610199286858704 |  |
| 158500000.0 | 47517104593000000 | 48683787217600400 |  |
| 158750000.0 | 47592052707500000 | 48757379316822600 |  |
| 159000000.0 | 47667000822000000 | 48830975565566000 |  |
| 159250000.0 | 47741948936500000 | 48904575944985200 |  |
| 159500000.0 | 47816897051000000 | 48978180436347696 |  |
| 159750000.0 | 47891845165500000 | 49051789021033000 |  |
| 160000000.0 | 47966793280000000 | 49125401680531696 |  |
| 160250000.0 | 48041741394500000 | 49199018396445104 |  |
| 160500000.0 | 48116689509000000 | 49272639150483904 |  |
| 160750000.0 | 48191637623500000 | 49346263924467800 |  |
| 161000000.0 | 48266585738000000 | 49419892700324200 |  |
| 161250000.0 | 48341533852500000 | 49493525460087800 |  |
| 161500000.0 | 48416481967000000 | 49567162185899800 |  |
| 161750000.0 | 48491430081500000 | 49640802860007000 |  |
| 162000000.0 | 48566378196000000 | 49714447464761000 |  |
| 162250000.0 | 48641326310500000 | 49788095982617400 |  |
| 162500000.0 | 48716274425000000 | 49861748396135400 |  |
| 162750000.0 | 48791222539500000 | 49935404687976600 |  |
| 163000000.0 | 48866170654000000 | 50009064840904496 |  |
| 163250000.0 | 48941118768500000 | 50082728837783504 |  |
| 163500000.0 | 49016066883000000 | 50156396661578704 |  |
| 163750000.0 | 49091014997500000 | 50230068295354496 |  |
| 164000000.0 | 49165963112000000 | 50303743722274496 |  |
| 164250000.0 | 49240911226500000 | 50377422925600200 |  |
| 164500000.0 | 49315859341000000 | 50451105888690800 |  |
| 164750000.0 | 49390807455500000 | 50524792595002304 |  |
| 165000000.0 | 49465755570000000 | 50598483028086704 |  |
| 165250000.0 | 49540703684500000 | 50672177171591400 |  |
| 165500000.0 | 49615651799000000 | 50745875009258496 |  |
| 165750000.0 | 49690599913500000 | 50819576524924096 |  |
| 166000000.0 | 49765548028000000 | 50893281702517904 |  |
| 166250000.0 | 49840496142500000 | 50966990526062096 |  |
| 166500000.0 | 49915444257000000 | 51040702979670896 |  |
| 166750000.0 | 49990392371500000 | 51114419047550000 |  |
| 167000000.0 | 50065340486000000 | 51188138713995696 |  |
| 167250000.0 | 50140288600500000 | 51261861963394496 |  |
| 167500000.0 | 50215236715000000 | 51335588780222304 |  |
| 167750000.0 | 50290184829500000 | 51409319149043696 |  |
| 168000000.0 | 50365132944000000 | 51483053054511800 |  |
| 168250000.0 | 50440081058500000 | 51556790481366800 |  |
| 168500000.0 | 50515029173000000 | 51630531414436200 |  |
| 168750000.0 | 50589977287500000 | 51704275838633696 |  |
| 169000000.0 | 50664925402000000 | 51778023738958704 |  |
| 169250000.0 | 50739873516500000 | 51851775100495800 |  |
| 169500000.0 | 50814821631000000 | 51925529908414000 |  |
| 169750000.0 | 50889769745500000 | 51999288147966304 |  |
| 170000000.0 | 50964717860000000 | 52073049804489000 |  |
| 170250000.0 | 51039665974500000 | 52146814863401104 |  |
| 170500000.0 | 51114614089000000 | 52220583310204000 |  |
| 170750000.0 | 51189562203500000 | 52294355130480400 |  |
| 171000000.0 | 51264510318000000 | 52368130309894304 |  |
| 171250000.0 | 51339458432500000 | 52441908834189904 |  |
| 171500000.0 | 51414406547000000 | 52515690689191600 |  |
| 171750000.0 | 51489354661500000 | 52589475860803000 |  |
| 172000000.0 | 51564302776000000 | 52663264335006400 |  |
| 172250000.0 | 51639250890500000 | 52737056097862496 |  |
| 172500000.0 | 51714199005000000 | 52810851135509904 |  |
| 172750000.0 | 51789147119500000 | 52884649434163904 |  |
| 173000000.0 | 51864095234000000 | 52958450980117000 |  |
| 173250000.0 | 51939043348500000 | 53032255759737296 |  |
| 173500000.0 | 52013991463000000 | 53106063759468896 |  |
| 173750000.0 | 52088939577500000 | 53179874965830800 |  |
| 174000000.0 | 52163887692000000 | 53253689365416704 |  |
| 174250000.0 | 52238835806500000 | 53327506944894096 |  |
| 174500000.0 | 52313783921000000 | 53401327691004200 |  |
| 174750000.0 | 52388732035500000 | 53475151590561296 |  |
| 175000000.0 | 52463680150000000 | 53548978630452304 |  |
| 175250000.0 | 52538628264500000 | 53622808797635800 |  |
| 175500000.0 | 52613576379000000 | 53696642079142400 |  |
| 175750000.0 | 52688524493500000 | 53770478462073504 |  |
| 176000000.0 | 52763472608000000 | 53844317933601200 |  |
| 176250000.0 | 52838420722500000 | 53918160480967696 |  |
| 176500000.0 | 52913368837000000 | 53992006091484800 |  |
| 176750000.0 | 52988316951500000 | 54065854752533600 |  |
| 177000000.0 | 53063265066000000 | 54139706451563600 |  |
| 177250000.0 | 53138213180500000 | 54213561176092896 |  |
| 177500000.0 | 53213161295000000 | 54287418913707104 |  |
| 177750000.0 | 53288109409500000 | 54361279652059296 |  |
| 178000000.0 | 53363057524000000 | 54435143378869504 |  |
| 178250000.0 | 53438005638500000 | 54509010081923904 |  |
| 178500000.0 | 53512953753000000 | 54582879749074800 |  |
| 178750000.0 | 53587901867500000 | 54656752368240200 |  |
| 179000000.0 | 53662849982000000 | 54730627927402896 |  |
| 179250000.0 | 53737798096500000 | 54804506414610496 |  |
| 179500000.0 | 53812746211000000 | 54878387817974896 |  |
| 179750000.0 | 53887694325500000 | 54952272125671800 |  |
| 180000000.0 | 53962642440000000 | 55026159325940000 |  |
| 180250000.0 | 54037590554500000 | 55100049407081696 |  |
| 180500000.0 | 54112538669000000 | 55173942357461296 |  |
| 180750000.0 | 54187486783500000 | 55247838165505504 |  |
| 181000000.0 | 54262434898000000 | 55321736819702704 |  |
| 181250000.0 | 54337383012500000 | 55395638308602400 |  |
| 181500000.0 | 54412331127000000 | 55469542620815296 |  |
| 181750000.0 | 54487279241500000 | 55543449745012496 |  |
| 182000000.0 | 54562227356000000 | 55617359669925104 |  |
| 182250000.0 | 54637175470500000 | 55691272384344000 |  |
| 182500000.0 | 54712123585000000 | 55765187877119400 |  |
| 182750000.0 | 54787071699500000 | 55839106137160496 |  |
| 183000000.0 | 54862019814000000 | 55913027153434800 |  |
| 183250000.0 | 54936967928500000 | 55986950914968304 |  |
| 183500000.0 | 55011916043000000 | 56060877410844496 |  |
| 183750000.0 | 55086864157500000 | 56134806630204496 |  |
| 184000000.0 | 55161812272000000 | 56208738562246200 |  |
| 184250000.0 | 55236760386500000 | 56282673196224400 |  |
| 184500000.0 | 55311708501000000 | 56356610521450000 |  |
| 184750000.0 | 55386656615500000 | 56430550527289904 |  |
| 185000000.0 | 55461604730000000 | 56504493203166600 |  |
| 185250000.0 | 55536552844500000 | 56578438538557696 |  |
| 185500000.0 | 55611500959000000 | 56652386522995800 |  |
| 185750000.0 | 55686449073500000 | 56726337146067800 |  |
| 186000000.0 | 55761397188000000 | 56800290397414800 |  |
| 186250000.0 | 55836345302500000 | 56874246266731696 |  |
| 186500000.0 | 55911293417000000 | 56948204743766896 |  |
| 186750000.0 | 55986241531500000 | 57022165818321800 |  |
| 187000000.0 | 56061189646000000 | 57096129480250704 |  |
| 187250000.0 | 56136137760500000 | 57170095719460096 |  |
| 187500000.0 | 56211085875000000 | 57244064525908800 |  |
| 187750000.0 | 56286033989500000 | 57318035889607104 |  |
| 188000000.0 | 56360982104000000 | 57392009800617000 |  |
| 188250000.0 | 56435930218500000 | 57465986249051504 |  |
| 188500000.0 | 56510878333000000 | 57539965225074096 |  |
| 188750000.0 | 56585826447500000 | 57613946718899200 |  |
| 189000000.0 | 56660774562000000 | 57687930720791000 |  |
| 189250000.0 | 56735722676500000 | 57761917221063504 |  |
| 189500000.0 | 56810670791000000 | 57835906210080304 |  |
| 189750000.0 | 56885618905500000 | 57909897678254304 |  |
| 190000000.0 | 56960567020000000 | 57983891616046896 |  |
| 190250000.0 | 57035515134500000 | 58057888013968400 |  |
| 190500000.0 | 57110463249000000 | 58131886862577200 |  |
| 190750000.0 | 57185411363500000 | 58205888152479504 |  |
| 191000000.0 | 57260359478000000 | 58279891874329400 |  |
| 191250000.0 | 57335307592500000 | 58353898018828304 |  |
| 191500000.0 | 57410255707000000 | 58427906576724400 |  |
| 191750000.0 | 57485203821500000 | 58501917538812896 |  |
| 192000000.0 | 57560151936000000 | 58575930895935400 |  |
| 192250000.0 | 57635100050500000 | 58649946638979504 |  |
| 192500000.0 | 57710048165000000 | 58723964758879000 |  |
| 192750000.0 | 57784996279500000 | 58797985246613000 |  |
| 193000000.0 | 57859944394000000 | 58872008093206000 |  |
| 193250000.0 | 57934892508500000 | 58946033289727504 |  |
| 193500000.0 | 58009840623000000 | 59020060827291904 |  |
| 193750000.0 | 58084788737500000 | 59094090697057696 |  |
| 194000000.0 | 58159736852000000 | 59168122890228000 |  |
| 194250000.0 | 58234684966500000 | 59242157398049696 |  |
| 194500000.0 | 58309633081000000 | 59316194211813000 |  |
| 194750000.0 | 58384581195500000 | 59390233322852000 |  |
| 195000000.0 | 58459529310000000 | 59464274722543504 |  |
| 195250000.0 | 58534477424500000 | 59538318402307400 |  |
| 195500000.0 | 58609425539000000 | 59612364353606000 |  |
| 195750000.0 | 58684373653500000 | 59686412567944000 |  |
| 196000000.0 | 58759321768000000 | 59760463036868096 |  |
| 196250000.0 | 58834269882500000 | 59834515751966800 |  |
| 196500000.0 | 58909217997000000 | 59908570704870304 |  |
| 196750000.0 | 58984166111500000 | 59982627887249696 |  |
| 197000000.0 | 59059114226000000 | 60056687290817600 |  |
| 197250000.0 | 59134062340500000 | 60130748907327000 |  |
| 197500000.0 | 59209010455000000 | 60204812728571696 |  |
| 197750000.0 | 59283958569500000 | 60278878746385600 |  |
| 198000000.0 | 59358906684000000 | 60352946952642600 |  |
| 198250000.0 | 59433854798500000 | 60427017339256704 |  |
| 198500000.0 | 59508802913000000 | 60501089898181104 |  |
| 198750000.0 | 59583751027500000 | 60575164621408496 |  |
| 199000000.0 | 59658699142000000 | 60649241500970600 |  |
| 199250000.0 | 59733647256500000 | 60723320528938096 |  |
| 199500000.0 | 59808595371000000 | 60797401697420000 |  |
| 199750000.0 | 59883543485500000 | 60871484998564000 |  |
| 200000000.0 | 59958491600000000 | 60945570424555600 |  |
| 200250000.0 | 60033439714500000 | 61019657967618600 |  |
| 200500000.0 | 60108387829000000 | 61093747620014096 |  |
| 200750000.0 | 60183335943500000 | 61167839374040800 |  |
| 201000000.0 | 60258284058000000 | 61241933222034800 |  |
| 201250000.0 | 60333232172500000 | 61316029156369000 |  |
| 201500000.0 | 60408180287000000 | 61390127169453104 |  |
| 201750000.0 | 60483128401500000 | 61464227253733400 |  |
| 202000000.0 | 60558076516000000 | 61538329401692496 |  |
| 202250000.0 | 60633024630500000 | 61612433605849296 |  |
| 202500000.0 | 60707972745000000 | 61686539858758400 |  |
| 202750000.0 | 60782920859500000 | 61760648153010200 |  |
| 203000000.0 | 60857868974000000 | 61834758481230400 |  |
| 203250000.0 | 60932817088500000 | 61908870836080400 |  |
| 203500000.0 | 61007765203000000 | 61982985210256200 |  |
| 203750000.0 | 61082713317500000 | 62057101596489000 |  |
| 204000000.0 | 61157661432000000 | 62131219987544496 |  |
| 204250000.0 | 61232609546500000 | 62205340376222704 |  |
| 204500000.0 | 61307557661000000 | 62279462755358096 |  |
| 204750000.0 | 61382505775500000 | 62353587117819200 |  |
| 205000000.0 | 61457453890000000 | 62427713456508096 |  |
| 205250000.0 | 61532402004500000 | 62501841764360896 |  |
| 205500000.0 | 61607350119000000 | 62575972034346800 |  |
| 205750000.0 | 61682298233500000 | 62650104259468496 |  |
| 206000000.0 | 61757246348000000 | 62724238432761600 |  |
| 206250000.0 | 61832194462500000 | 62798374547294704 |  |
| 206500000.0 | 61907142577000000 | 62872512596168800 |  |
| 206750000.0 | 61982090691500000 | 62946652572517600 |  |
| 207000000.0 | 62057038806000000 | 63020794469507104 |  |
| 207250000.0 | 62131986920500000 | 63094938280335200 |  |
| 207500000.0 | 62206935035000000 | 63169083998232000 |  |
| 207750000.0 | 62281883149500000 | 63243231616458896 |  |
| 208000000.0 | 62356831264000000 | 63317381128309296 |  |
| 208250000.0 | 62431779378500000 | 63391532527107600 |  |
| 208500000.0 | 62506727493000000 | 63465685806209504 |  |
| 208750000.0 | 62581675607500000 | 63539840959001800 |  |
| 209000000.0 | 62656623722000000 | 63613997978902000 |  |
| 209250000.0 | 62731571836500000 | 63688156859358096 |  |
| 209500000.0 | 62806519951000000 | 63762317593848800 |  |
| 209750000.0 | 62881468065500000 | 63836480175883000 |  |
| 210000000.0 | 62956416180000000 | 63910644598999600 |  |
| 210250000.0 | 63031364294500000 | 63984810856767600 |  |
| 210500000.0 | 63106312409000000 | 64058978942785600 |  |
| 210750000.0 | 63181260523500000 | 64133148850682000 |  |
| 211000000.0 | 63256208638000000 | 64207320574114096 |  |
| 211250000.0 | 63331156752500000 | 64281494106769296 |  |
| 211500000.0 | 63406104867000000 | 64355669442363296 |  |
| 211750000.0 | 63481052981500000 | 64429846574641200 |  |
| 212000000.0 | 63556001096000000 | 64504025497376704 |  |
| 212250000.0 | 63630949210500000 | 64578206204371904 |  |
| 212500000.0 | 63705897325000000 | 64652388689457504 |  |
| 212750000.0 | 63780845439500000 | 64726572946492600 |  |
| 213000000.0 | 63855793554000000 | 64800758969364200 |  |
| 213250000.0 | 63930741668500000 | 64874946751987296 |  |
| 213500000.0 | 64005689783000000 | 64949136288304600 |  |
| 213750000.0 | 64080637897500000 | 65023327572286496 |  |
| 214000000.0 | 64155586012000000 | 65097520597931104 |  |
| 214250000.0 | 64230534126500000 | 65171715359263296 |  |
| 214500000.0 | 64305482241000000 | 65245911850335600 |  |
| 214750000.0 | 64380430355500000 | 65320110065227296 |  |
| 215000000.0 | 64455378470000000 | 65394309998044600 |  |
| 215250000.0 | 64530326584500000 | 65468511642920496 |  |
| 215500000.0 | 64605274699000000 | 65542714994014304 |  |
| 215750000.0 | 64680222813500000 | 65616920045511904 |  |
| 216000000.0 | 64755170928000000 | 65691126791625504 |  |
| 216250000.0 | 64830119042500000 | 65765335226593296 |  |
| 216500000.0 | 64905067157000000 | 65839545344679504 |  |
| 216750000.0 | 64980015271500000 | 65913757140174000 |  |
| 217000000.0 | 65054963386000000 | 65987970607392496 |  |
| 217250000.0 | 65129911500500000 | 66062185740676200 |  |
| 217500000.0 | 65204859615000000 | 66136402534391696 |  |
| 217750000.0 | 65279807729500000 | 66210620982930896 |  |
| 218000000.0 | 65354755844000000 | 66284841080710600 |  |
| 218250000.0 | 65429703958500000 | 66359062822172704 |  |
| 218500000.0 | 65504652073000000 | 66433286201784000 |  |
| 218750000.0 | 65579600187500000 | 66507511214035800 |  |
| 219000000.0 | 65654548302000000 | 66581737853444200 |  |
| 219250000.0 | 65729496416500000 | 66655966114549400 |  |
| 219500000.0 | 65804444531000000 | 66730195991916200 |  |
| 219750000.0 | 65879392645500000 | 66804427480133296 |  |
| 220000000.0 | 65954340760000000 | 66878660573813504 |  |
| 220250000.0 | 66029288874500000 | 66952895267593504 |  |
| 220500000.0 | 66104236989000000 | 67027131556133800 |  |
| 220750000.0 | 66179185103500000 | 67101369434118304 |  |
| 221000000.0 | 66254133218000000 | 67175608896254704 |  |
| 221250000.0 | 66329081332500000 | 67249849937273696 |  |
| 221500000.0 | 66404029447000000 | 67324092551929696 |  |
| 221750000.0 | 66478977561500000 | 67398336734999696 |  |
| 222000000.0 | 66553925676000000 | 67472582481284000 |  |
| 222250000.0 | 66628873790500000 | 67546829785605600 |  |
| 222500000.0 | 66703821905000000 | 67621078642810304 |  |
| 222750000.0 | 66778770019500000 | 67695329047766600 |  |
| 223000000.0 | 66853718134000000 | 67769580995365200 |  |
| 223250000.0 | 66928666248500000 | 67843834480519400 |  |
| 223500000.0 | 67003614363000000 | 67918089498164600 |  |
| 223750000.0 | 67078562477500000 | 67992346043258496 |  |
| 224000000.0 | 67153510592000000 | 68066604110780600 |  |
| 224250000.0 | 67228458706500000 | 68140863695732304 |  |
| 224500000.0 | 67303406821000000 | 68215124793136800 |  |
| 224750000.0 | 67378354935500000 | 68289387398039000 |  |
| 225000000.0 | 67453303050000000 | 68363651505505104 |  |
| 225250000.0 | 67528251164500000 | 68437917110623104 |  |
| 225500000.0 | 67603199279000000 | 68512184208502000 |  |
| 225750000.0 | 67678147393500000 | 68586452794271904 |  |
| 226000000.0 | 67753095508000000 | 68660722863084200 |  |
| 226250000.0 | 67828043622500000 | 68734994410111104 |  |
| 226500000.0 | 67902991737000000 | 68809267430545696 |  |
| 226750000.0 | 67977939851500000 | 68883541919601696 |  |
| 227000000.0 | 68052887966000000 | 68957817872513696 |  |
| 227250000.0 | 68127836080500000 | 69032095284536496 |  |
| 227500000.0 | 68202784195000000 | 69106374150945504 |  |
| 227750000.0 | 68277732309500000 | 69180654467036200 |  |
| 228000000.0 | 68352680424000000 | 69254936228124496 |  |
| 228250000.0 | 68427628538500000 | 69329219429546096 |  |
| 228500000.0 | 68502576653000000 | 69403504066656800 |  |
| 228750000.0 | 68577524767500000 | 69477790134832400 |  |
| 229000000.0 | 68652472882000000 | 69552077629468304 |  |
| 229250000.0 | 68727420996500000 | 69626366545979400 |  |
| 229500000.0 | 68802369111000000 | 69700656879800400 |  |
| 229750000.0 | 68877317225500000 | 69774948626385400 |  |
| 230000000.0 | 68952265340000000 | 69849241781207600 |  |
| 230250000.0 | 69027213454500000 | 69923536339759696 |  |
| 230500000.0 | 69102161569000000 | 69997832297553504 |  |
| 230750000.0 | 69177109683500000 | 70072129650119600 |  |
| 231000000.0 | 69252057798000000 | 70146428393007904 |  |
| 231250000.0 | 69327005912500000 | 70220728521786704 |  |
| 231500000.0 | 69401954027000000 | 70295030032043400 |  |
| 231750000.0 | 69476902141500000 | 70369332919383904 |  |
| 232000000.0 | 69551850256000000 | 70443637179432496 |  |
| 232250000.0 | 69626798370500000 | 70517942807832096 |  |
| 232500000.0 | 69701746485000000 | 70592249800243904 |  |
| 232750000.0 | 69776694599500000 | 70666558152347400 |  |
| 233000000.0 | 69851642714000000 | 70740867859840200 |  |
| 233250000.0 | 69926590828500000 | 70815178918437904 |  |
| 233500000.0 | 70001538943000000 | 70889491323874000 |  |
| 233750000.0 | 70076487057500000 | 70963805071900200 |  |
| 234000000.0 | 70151435172000000 | 71038120158285600 |  |
| 234250000.0 | 70226383286500000 | 71112436578817200 |  |
| 234500000.0 | 70301331401000000 | 71186754329299504 |  |
| 234750000.0 | 70376279515500000 | 71261073405554400 |  |
| 235000000.0 | 70451227630000000 | 71335393803421504 |  |
| 235250000.0 | 70526175744500000 | 71409715518757504 |  |
| 235500000.0 | 70601123859000000 | 71484038547436304 |  |
| 235750000.0 | 70676071973500000 | 71558362885349104 |  |
| 236000000.0 | 70751020088000000 | 71632688528404000 |  |
| 236250000.0 | 70825968202500000 | 71707015472526096 |  |
| 236500000.0 | 70900916317000000 | 71781343713657504 |  |
| 236750000.0 | 70975864431500000 | 71855673247756896 |  |
| 237000000.0 | 71050812546000000 | 71930004070799800 |  |
| 237250000.0 | 71125760660500000 | 72004336178778400 |  |
| 237500000.0 | 71200708775000000 | 72078669567701104 |  |
| 237750000.0 | 71275656889500000 | 72153004233593200 |  |
| 238000000.0 | 71350605004000000 | 72227340172496000 |  |
| 238250000.0 | 71425553118500000 | 72301677380467392 |  |
| 238500000.0 | 71500501233000000 | 72376015853581104 |  |
| 238750000.0 | 71575449347500000 | 72450355587927200 |  |
| 239000000.0 | 71650397462000000 | 72524696579611808 |  |
| 239250000.0 | 71725345576500000 | 72599038824756800 |  |
| 239500000.0 | 71800293691000000 | 72673382319500192 |  |
| 239750000.0 | 71875241805500000 | 72747727059995600 |  |
| 240000000.0 | 71950189920000000 | 72822073042412304 |  |
| 240250000.0 | 72025138034500000 | 72896420262935392 |  |
| 240500000.0 | 72100086149000000 | 72970768717765296 |  |
| 240750000.0 | 72175034263500000 | 73045118403118000 |  |
| 241000000.0 | 72249982378000000 | 73119469315224992 |  |
| 241250000.0 | 72324930492500000 | 73193821450332992 |  |
| 241500000.0 | 72399878607000000 | 73268174804703808 |  |
| 241750000.0 | 72474826721500000 | 73342529374614592 |  |
| 242000000.0 | 72549774836000000 | 73416885156357504 |  |
| 242250000.0 | 72624722950500000 | 73491242146239696 |  |
| 242500000.0 | 72699671065000000 | 73565600340583392 |  |
| 242750000.0 | 72774619179500000 | 73639959735725408 |  |
| 243000000.0 | 72849567294000000 | 73714320328017504 |  |
| 243250000.0 | 72924515408500000 | 73788682113826208 |  |
| 243500000.0 | 72999463523000000 | 73863045089532608 |  |
| 243750000.0 | 73074411637500000 | 73937409251532192 |  |
| 244000000.0 | 73149359752000000 | 74011774596235200 |  |
| 244250000.0 | 73224307866500000 | 74086141120066208 |  |
| 244500000.0 | 73299255981000000 | 74160508819463904 |  |
| 244750000.0 | 73374204095500000 | 74234877690881600 |  |
| 245000000.0 | 73449152210000000 | 74309247730786592 |  |
| 245250000.0 | 73524100324500000 | 74383618935660400 |  |
| 245500000.0 | 73599048439000000 | 74457991301998496 |  |
| 245750000.0 | 73673996553500000 | 74532364826310304 |  |
| 246000000.0 | 73748944668000000 | 74606739505119504 |  |
| 246250000.0 | 73823892782500000 | 74681115334963104 |  |
| 246500000.0 | 73898840897000000 | 74755492312392400 |  |
| 246750000.0 | 73973789011500000 | 74829870433972000 |  |
| 247000000.0 | 74048737126000000 | 74904249696280400 |  |
| 247250000.0 | 74123685240500000 | 74978630095909696 |  |
| 247500000.0 | 74198633355000000 | 75053011629465200 |  |
| 247750000.0 | 74273581469500000 | 75127394293566000 |  |
| 248000000.0 | 74348529584000000 | 75201778084844400 |  |
| 248250000.0 | 74423477698500000 | 75276162999946000 |  |
| 248500000.0 | 74498425813000000 | 75350549035529792 |  |
| 248750000.0 | 74573373927500000 | 75424936188267696 |  |
| 249000000.0 | 74648322042000000 | 75499324454844992 |  |
| 249250000.0 | 74723270156500000 | 75573713831959904 |  |
| 249500000.0 | 74798218271000000 | 75648104316323696 |  |
| 249750000.0 | 74873166385500000 | 75722495904660496 |  |
| 250000000.0 | 74948114500000000 | 75796888593707296 |  |
| 250250000.0 | 75023062614500000 | 75871282380213792 |  |
| 250500000.0 | 75098010729000000 | 75945677260942800 |  |
| 250750000.0 | 75172958843500000 | 76020073232669296 |  |
| 251000000.0 | 75247906958000000 | 76094470292181200 |  |
| 251250000.0 | 75322855072500000 | 76168868436278896 |  |
| 251500000.0 | 75397803187000000 | 76243267661775296 |  |
| 251750000.0 | 75472751301500000 | 76317667965495600 |  |
| 252000000.0 | 75547699416000000 | 76392069344277600 |  |
| 252250000.0 | 75622647530500000 | 76466471794971200 |  |
| 252500000.0 | 75697595645000000 | 76540875314438592 |  |
| 252750000.0 | 75772543759500000 | 76615279899554304 |  |
| 253000000.0 | 75847491874000000 | 76689685547204800 |  |
| 253250000.0 | 75922439988500000 | 76764092254288800 |  |
| 253500000.0 | 75997388103000000 | 76838500017716800 |  |
| 253750000.0 | 76072336217500000 | 76912908834411504 |  |
| 254000000.0 | 76147284332000000 | 76987318701307296 |  |
| 254250000.0 | 76222232446500000 | 77061729615350704 |  |
| 254500000.0 | 76297180561000000 | 77136141573499600 |  |
| 254750000.0 | 76372128675500000 | 77210554572724000 |  |
| 255000000.0 | 76447076790000000 | 77284968610005408 |  |
| 255250000.0 | 76522024904500000 | 77359383682336896 |  |
| 255500000.0 | 76596973019000000 | 77433799786723200 |  |
| 255750000.0 | 76671921133500000 | 77508216920180496 |  |
| 256000000.0 | 76746869248000000 | 77582635079736400 |  |
| 256250000.0 | 76821817362500000 | 77657054262430096 |  |
| 256500000.0 | 76896765477000000 | 77731474465311808 |  |
| 256750000.0 | 76971713591500000 | 77805895685443200 |  |
| 257000000.0 | 77046661706000000 | 77880317919897408 |  |
| 257250000.0 | 77121609820500000 | 77954741165758304 |  |
| 257500000.0 | 77196557935000000 | 78029165420121104 |  |
| 257750000.0 | 77271506049500000 | 78103590680092192 |  |
| 258000000.0 | 77346454164000000 | 78178016942788800 |  |
| 258250000.0 | 77421402278500000 | 78252444205339200 |  |
| 258500000.0 | 77496350393000000 | 78326872464882704 |  |
| 258750000.0 | 77571298507500000 | 78401301718569200 |  |
| 259000000.0 | 77646246622000000 | 78475731963559696 |  |
| 259250000.0 | 77721194736500000 | 78550163197025792 |  |
| 259500000.0 | 77796142851000000 | 78624595416149792 |  |
| 259750000.0 | 77871090965500000 | 78699028618124704 |  |
| 260000000.0 | 77946039080000000 | 78773462800154208 |  |
| 260250000.0 | 78020987194500000 | 78847897959452400 |  |
| 260500000.0 | 78095935309000000 | 78922334093244096 |  |
| 260750000.0 | 78170883423500000 | 78996771198764304 |  |
| 261000000.0 | 78245831538000000 | 79071209273258704 |  |
| 261250000.0 | 78320779652500000 | 79145648313983200 |  |
| 261500000.0 | 78395727767000000 | 79220088318204096 |  |
| 261750000.0 | 78470675881500000 | 79294529283197792 |  |
| 262000000.0 | 78545623996000000 | 79368971206251104 |  |
| 262250000.0 | 78620572110500000 | 79443414084660896 |  |
| 262500000.0 | 78695520225000000 | 79517857915734304 |  |
| 262750000.0 | 78770468339500000 | 79592302696788304 |  |
| 263000000.0 | 78845416454000000 | 79666748425150208 |  |
| 263250000.0 | 78920364568500000 | 79741195098156992 |  |
| 263500000.0 | 78995312683000000 | 79815642713155696 |  |
| 263750000.0 | 79070260797500000 | 79890091267503504 |  |
| 264000000.0 | 79145208912000000 | 79964540758566896 |  |
| 264250000.0 | 79220157026500000 | 80038991183722800 |  |
| 264500000.0 | 79295105141000000 | 80113442540357296 |  |
| 264750000.0 | 79370053255500000 | 80187894825866592 |  |
| 265000000.0 | 79445001370000000 | 80262348037656496 |  |
| 265250000.0 | 79519949484500000 | 80336802173142096 |  |
| 265500000.0 | 79594897599000000 | 80411257229748608 |  |
| 265750000.0 | 79669845713500000 | 80485713204910304 |  |
| 266000000.0 | 79744793828000000 | 80560170096071200 |  |
| 266250000.0 | 79819741942500000 | 80634627900684608 |  |
| 266500000.0 | 79894690057000000 | 80709086616213408 |  |
| 266750000.0 | 79969638171500000 | 80783546240129696 |  |
| 267000000.0 | 80044586286000000 | 80858006769915008 |  |
| 267250000.0 | 80119534400500000 | 80932468203059808 |  |
| 267500000.0 | 80194482515000000 | 81006930537064304 |  |
| 267750000.0 | 80269430629500000 | 81081393769437696 |  |
| 268000000.0 | 80344378744000000 | 81155857897698096 |  |
| 268250000.0 | 80419326858500000 | 81230322919372992 |  |
| 268500000.0 | 80494274973000000 | 81304788831998704 |  |
| 268750000.0 | 80569223087500000 | 81379255633120800 |  |
| 269000000.0 | 80644171202000000 | 81453723320293792 |  |
| 269250000.0 | 80719119316500000 | 81528191891080992 |  |
| 269500000.0 | 80794067431000000 | 81602661343054704 |  |
| 269750000.0 | 80869015545500000 | 81677131673796096 |  |
| 270000000.0 | 80943963660000000 | 81751602880895104 |  |
| 270250000.0 | 81018911774500000 | 81826074961950400 |  |
| 270500000.0 | 81093859889000000 | 81900547914569600 |  |
| 270750000.0 | 81168808003500000 | 81975021736368704 |  |
| 271000000.0 | 81243756118000000 | 82049496424972704 |  |
| 271250000.0 | 81318704232500000 | 82123971978014896 |  |
| 271500000.0 | 81393652347000000 | 82198448393137408 |  |
| 271750000.0 | 81468600461500000 | 82272925667990800 |  |
| 272000000.0 | 81543548576000000 | 82347403800234096 |  |
| 272250000.0 | 81618496690500000 | 82421882787534800 |  |
| 272500000.0 | 81693444805000000 | 82496362627568992 |  |
| 272750000.0 | 81768392919500000 | 82570843318020896 |  |
| 273000000.0 | 81843341034000000 | 82645324856583392 |  |
| 273250000.0 | 81918289148500000 | 82719807240957296 |  |
| 273500000.0 | 81993237263000000 | 82794290468852000 |  |
| 273750000.0 | 82068185377500000 | 82868774537984896 |  |
| 274000000.0 | 82143133492000000 | 82943259446081792 |  |
| 274250000.0 | 82218081606500000 | 83017745190876704 |  |
| 274500000.0 | 82293029721000000 | 83092231770111600 |  |
| 274750000.0 | 82367977835500000 | 83166719181536400 |  |
| 275000000.0 | 82442925950000000 | 83241207422909504 |  |
| 275250000.0 | 82517874064500000 | 83315696491996992 |  |
| 275500000.0 | 82592822179000000 | 83390186386573104 |  |
| 275750000.0 | 82667770293500000 | 83464677104420000 |  |
| 276000000.0 | 82742718408000000 | 83539168643327504 |  |
| 276250000.0 | 82817666522500000 | 83613661001093696 |  |
| 276500000.0 | 82892614637000000 | 83688154175524304 |  |
| 276750000.0 | 82967562751500000 | 83762648164432896 |  |
| 277000000.0 | 83042510866000000 | 83837142965640800 |  |
| 277250000.0 | 83117458980500000 | 83911638576977200 |  |
| 277500000.0 | 83192407095000000 | 83986134996278800 |  |
| 277750000.0 | 83267355209500000 | 84060632221390000 |  |
| 278000000.0 | 83342303324000000 | 84135130250163008 |  |
| 278250000.0 | 83417251438500000 | 84209629080457408 |  |
| 278500000.0 | 83492199553000000 | 84284128710140496 |  |
| 278750000.0 | 83567147667500000 | 84358629137087200 |  |
| 279000000.0 | 83642095782000000 | 84433130359179808 |  |
| 279250000.0 | 83717043896500000 | 84507632374308000 |  |
| 279500000.0 | 83791992011000000 | 84582135180368992 |  |
| 279750000.0 | 83866940125500000 | 84656638775267504 |  |
| 280000000.0 | 83941888240000000 | 84731143156915504 |  |
| 280250000.0 | 84016836354500000 | 84805648323232304 |  |
| 280500000.0 | 84091784469000000 | 84880154272144608 |  |
| 280750000.0 | 84166732583500000 | 84954661001586208 |  |
| 281000000.0 | 84241680698000000 | 85029168509498400 |  |
| 281250000.0 | 84316628812500000 | 85103676793829600 |  |
| 281500000.0 | 84391576927000000 | 85178185852535200 |  |
| 281750000.0 | 84466525041500000 | 85252695683578096 |  |
| 282000000.0 | 84541473156000000 | 85327206284928096 |  |
| 282250000.0 | 84616421270500000 | 85401717654562000 |  |
| 282500000.0 | 84691369385000000 | 85476229790463808 |  |
| 282750000.0 | 84766317499500000 | 85550742690624704 |  |
| 283000000.0 | 84841265614000000 | 85625256353042496 |  |
| 283250000.0 | 84916213728500000 | 85699770775722208 |  |
| 283500000.0 | 84991161843000000 | 85774285956675808 |  |
| 283750000.0 | 85066109957500000 | 85848801893922000 |  |
| 284000000.0 | 85141058072000000 | 85923318585486496 |  |
| 284250000.0 | 85216006186500000 | 85997836029401904 |  |
| 284500000.0 | 85290954301000000 | 86072354223707600 |  |
| 284750000.0 | 85365902415500000 | 86146873166449504 |  |
| 285000000.0 | 85440850530000000 | 86221392855680704 |  |
| 285250000.0 | 85515798644500000 | 86295913289460800 |  |
| 285500000.0 | 85590746759000000 | 86370434465856096 |  |
| 285750000.0 | 85665694873500000 | 86444956382939600 |  |
| 286000000.0 | 85740642988000000 | 86519479038790800 |  |
| 286250000.0 | 85815591102500000 | 86594002431496096 |  |
| 286500000.0 | 85890539217000000 | 86668526559148400 |  |
| 286750000.0 | 85965487331500000 | 86743051419846896 |  |
| 287000000.0 | 86040435446000000 | 86817577011697600 |  |
| 287250000.0 | 86115383560500000 | 86892103332812896 |  |
| 287500000.0 | 86190331675000000 | 86966630381311808 |  |
| 287750000.0 | 86265279789500000 | 87041158155319600 |  |
| 288000000.0 | 86340227904000000 | 87115686652968000 |  |
| 288250000.0 | 86415176018500000 | 87190215872395104 |  |
| 288500000.0 | 86490124133000000 | 87264745811745600 |  |
| 288750000.0 | 86565072247500000 | 87339276469170208 |  |
| 289000000.0 | 86640020362000000 | 87413807842826096 |  |
| 289250000.0 | 86714968476500000 | 87488339930876800 |  |
| 289500000.0 | 86789916591000000 | 87562872731491904 |  |
| 289750000.0 | 86864864705500000 | 87637406242847392 |  |
| 290000000.0 | 86939812820000000 | 87711940463125408 |  |
| 290250000.0 | 87014760934500000 | 87786475390514208 |  |
| 290500000.0 | 87089709049000000 | 87861011023208304 |  |
| 290750000.0 | 87164657163500000 | 87935547359408304 |  |
| 291000000.0 | 87239605278000000 | 88010084397320800 |  |
| 291250000.0 | 87314553392500000 | 88084622135158704 |  |
| 291500000.0 | 87389501507000000 | 88159160571140704 |  |
| 291750000.0 | 87464449621500000 | 88233699703491504 |  |
| 292000000.0 | 87539397736000000 | 88308239530442208 |  |
| 292250000.0 | 87614345850500000 | 88382780050229408 |  |
| 292500000.0 | 87689293965000000 | 88457321261096000 |  |
| 292750000.0 | 87764242079500000 | 88531863161290400 |  |
| 293000000.0 | 87839190194000000 | 88606405749067504 |  |
| 293250000.0 | 87914138308500000 | 88680949022687392 |  |
| 293500000.0 | 87989086423000000 | 88755492980416608 |  |
| 293750000.0 | 88064034537500000 | 88830037620527200 |  |
| 294000000.0 | 88138982652000000 | 88904582941296992 |  |
| 294250000.0 | 88213930766500000 | 88979128941009600 |  |
| 294500000.0 | 88288878881000000 | 89053675617954704 |  |
| 294750000.0 | 88363826995500000 | 89128222970427200 |  |
| 295000000.0 | 88438775110000000 | 89202770996728000 |  |
| 295250000.0 | 88513723224500000 | 89277319695163696 |  |
| 295500000.0 | 88588671339000000 | 89351869064046496 |  |
| 295750000.0 | 88663619453500000 | 89426419101694096 |  |
| 296000000.0 | 88738567568000000 | 89500969806430000 |  |
| 296250000.0 | 88813515682500000 | 89575521176583200 |  |
| 296500000.0 | 88888463797000000 | 89650073210488304 |  |
| 296750000.0 | 88963411911500000 | 89724625906485408 |  |
| 297000000.0 | 89038360026000000 | 89799179262920000 |  |
| 297250000.0 | 89113308140500000 | 89873733278143392 |  |
| 297500000.0 | 89188256255000000 | 89948287950512096 |  |
| 297750000.0 | 89263204369500000 | 90022843278388192 |  |
| 298000000.0 | 89338152484000000 | 90097399260139008 |  |
| 298250000.0 | 89413100598500000 | 90171955894137504 |  |
| 298500000.0 | 89488048713000000 | 90246513178761904 |  |
| 298750000.0 | 89562996827500000 | 90321071112395808 |  |
| 299000000.0 | 89637944942000000 | 90395629693428096 |  |
| 299250000.0 | 89712893056500000 | 90470188920253200 |  |
| 299500000.0 | 89787841171000000 | 90544748791270400 |  |
| 299750000.0 | 89862789285500000 | 90619309304884704 |  |
| 300000000.0 | 89937737400000000 | 90693870459506096 |  |
| 300250000.0 | 90012685514500000 | 90768432253549792 |  |
| 300500000.0 | 90087633629000000 | 90842994685436496 |  |
| 300750000.0 | 90162581743500000 | 90917557753591696 |  |
| 301000000.0 | 90237529858000000 | 90992121456446304 |  |
| 301250000.0 | 90312477972500000 | 91066685792436304 |  |
| 301500000.0 | 90387426087000000 | 91141250760002704 |  |
| 301750000.0 | 90462374201500000 | 91215816357591904 |  |
| 302000000.0 | 90537322316000000 | 91290382583655008 |  |
| 302250000.0 | 90612270430500000 | 91364949436648400 |  |
| 302500000.0 | 90687218545000000 | 91439516915033600 |  |
| 302750000.0 | 90762166659500000 | 91514085017276800 |  |
| 303000000.0 | 90837114774000000 | 91588653741849600 |  |
| 303250000.0 | 90912062888500000 | 91663223087228192 |  |
| 303500000.0 | 90987011003000000 | 91737793051894000 |  |
| 303750000.0 | 91061959117500000 | 91812363634333296 |  |
| 304000000.0 | 91136907232000000 | 91886934833037200 |  |
| 304250000.0 | 91211855346500000 | 91961506646502000 |  |
| 304500000.0 | 91286803461000000 | 92036079073228304 |  |
| 304750000.0 | 91361751575500000 | 92110652111722208 |  |
| 305000000.0 | 91436699690000000 | 92185225760494304 |  |
| 305250000.0 | 91511647804500000 | 92259800018060000 |  |
| 305500000.0 | 91586595919000000 | 92334374882939696 |  |
| 305750000.0 | 91661544033500000 | 92408950353658208 |  |
| 306000000.0 | 91736492148000000 | 92483526428745600 |  |
| 306250000.0 | 91811440262500000 | 92558103106736304 |  |
| 306500000.0 | 91886388377000000 | 92632680386169600 |  |
| 306750000.0 | 91961336491500000 | 92707258265589504 |  |
| 307000000.0 | 92036284606000000 | 92781836743544608 |  |
| 307250000.0 | 92111232720500000 | 92856415818588304 |  |
| 307500000.0 | 92186180835000000 | 92930995489278592 |  |
| 307750000.0 | 92261128949500000 | 93005575754178096 |  |
| 308000000.0 | 92336077064000000 | 93080156611853792 |  |
| 308250000.0 | 92411025178500000 | 93154738060877792 |  |
| 308500000.0 | 92485973293000000 | 93229320099826304 |  |
| 308750000.0 | 92560921407500000 | 93303902727280400 |  |
| 309000000.0 | 92635869522000000 | 93378485941825296 |  |
| 309250000.0 | 92710817636500000 | 93453069742051200 |  |
| 309500000.0 | 92785765751000000 | 93527654126552496 |  |
| 309750000.0 | 92860713865500000 | 93602239093928304 |  |
| 310000000.0 | 92935661980000000 | 93676824642781792 |  |
| 310250000.0 | 93010610094500000 | 93751410771721104 |  |
| 310500000.0 | 93085558209000000 | 93825997479358400 |  |
| 310750000.0 | 93160506323500000 | 93900584764310496 |  |
| 311000000.0 | 93235454438000000 | 93975172625198496 |  |
| 311250000.0 | 93310402552500000 | 94049761060647808 |  |
| 311500000.0 | 93385350667000000 | 94124350069288304 |  |
| 311750000.0 | 93460298781500000 | 94198939649754400 |  |
| 312000000.0 | 93535246896000000 | 94273529800684304 |  |
| 312250000.0 | 93610195010500000 | 94348120520720992 |  |
| 312500000.0 | 93685143125000000 | 94422711808511696 |  |
| 312750000.0 | 93760091239500000 | 94497303662707600 |  |
| 313000000.0 | 93835039354000000 | 94571896081964496 |  |
| 313250000.0 | 93909987468500000 | 94646489064942304 |  |
| 313500000.0 | 93984935583000000 | 94721082610304992 |  |
| 313750000.0 | 94059883697500000 | 94795676716721104 |  |
| 314000000.0 | 94134831812000000 | 94870271382863008 |  |
| 314250000.0 | 94209779926500000 | 94944866607407296 |  |
| 314500000.0 | 94284728041000000 | 95019462389035104 |  |
| 314750000.0 | 94359676155500000 | 95094058726431200 |  |
| 315000000.0 | 94434624270000000 | 95168655618284800 |  |
| 315250000.0 | 94509572384500000 | 95243253063289104 |  |
| 315500000.0 | 94584520499000000 | 95317851060141504 |  |
| 315750000.0 | 94659468613500000 | 95392449607543296 |  |
| 316000000.0 | 94734416728000000 | 95467048704200000 |  |
| 316250000.0 | 94809364842500000 | 95541648348821104 |  |
| 316500000.0 | 94884312957000000 | 95616248540120192 |  |
| 316750000.0 | 94959261071500000 | 95690849276814800 |  |
| 317000000.0 | 95034209186000000 | 95765450557626400 |  |
| 317250000.0 | 95109157300500000 | 95840052381280608 |  |
| 317500000.0 | 95184105415000000 | 95914654746507008 |  |
| 317750000.0 | 95259053529500000 | 95989257652038800 |  |
| 318000000.0 | 95334001644000000 | 96063861096613600 |  |
| 318250000.0 | 95408949758500000 | 96138465078972608 |  |
| 318500000.0 | 95483897873000000 | 96213069597861104 |  |
| 318750000.0 | 95558845987500000 | 96287674652028192 |  |
| 319000000.0 | 95633794102000000 | 96362280240226896 |  |
| 319250000.0 | 95708742216500000 | 96436886361214096 |  |
| 319500000.0 | 95783690331000000 | 96511493013750304 |  |
| 319750000.0 | 95858638445500000 | 96586100196600192 |  |
| 320000000.0 | 95933586560000000 | 96660707908532096 |  |
| 320250000.0 | 96008534674500000 | 96735316148318208 |  |
| 320500000.0 | 96083482789000000 | 96809924914734304 |  |
| 320750000.0 | 96158430903500000 | 96884534206560304 |  |
| 321000000.0 | 96233379018000000 | 96959144022579504 |  |
| 321250000.0 | 96308327132500000 | 97033754361579104 |  |
| 321500000.0 | 96383275247000000 | 97108365222350208 |  |
| 321750000.0 | 96458223361500000 | 97182976603687392 |  |
| 322000000.0 | 96533171476000000 | 97257588504388992 |  |
| 322250000.0 | 96608119590500000 | 97332200923257104 |  |
| 322500000.0 | 96683067705000000 | 97406813859097504 |  |
| 322750000.0 | 96758015819500000 | 97481427310719296 |  |
| 323000000.0 | 96832963934000000 | 97556041276935904 |  |
| 323250000.0 | 96907912048500000 | 97630655756563600 |  |
| 323500000.0 | 96982860163000000 | 97705270748423008 |  |
| 323750000.0 | 97057808277500000 | 97779886251337696 |  |
| 324000000.0 | 97132756392000000 | 97854502264135296 |  |
| 324250000.0 | 97207704506500000 | 97929118785646800 |  |
| 324500000.0 | 97282652621000000 | 98003735814706800 |  |
| 324750000.0 | 97357600735500000 | 98078353350153504 |  |
| 325000000.0 | 97432548850000000 | 98152971390828608 |  |
| 325250000.0 | 97507496964500000 | 98227589935577296 |  |
| 325500000.0 | 97582445079000000 | 98302208983248304 |  |
| 325750000.0 | 97657393193500000 | 98376828532693792 |  |
| 326000000.0 | 97732341308000000 | 98451448582769504 |  |
| 326250000.0 | 97807289422500000 | 98526069132334592 |  |
| 326500000.0 | 97882237537000000 | 98600690180251696 |  |
| 326750000.0 | 97957185651500000 | 98675311725386896 |  |
| 327000000.0 | 98032133766000000 | 98749933766609600 |  |
| 327250000.0 | 98107081880500000 | 98824556302792800 |  |
| 327500000.0 | 98182029995000000 | 98899179332812896 |  |
| 327750000.0 | 98256978109500000 | 98973802855549408 |  |
| 328000000.0 | 98331926224000000 | 99048426869885600 |  |
| 328250000.0 | 98406874338500000 | 99123051374707808 |  |
| 328500000.0 | 98481822453000000 | 99197676368905792 |  |
| 328750000.0 | 98556770567500000 | 99272301851372896 |  |
| 329000000.0 | 98631718682000000 | 99346927821005504 |  |
| 329250000.0 | 98706666796500000 | 99421554276703392 |  |
| 329500000.0 | 98781614911000000 | 99496181217369600 |  |
| 329750000.0 | 98856563025500000 | 99570808641910592 |  |
| 330000000.0 | 98931511140000000 | 99645436549236000 |  |
| 330250000.0 | 99006459254500000 | 99720064938258704 |  |
| 330500000.0 | 99081407369000000 | 99794693807895008 |  |
| 330750000.0 | 99156355483500000 | 99869323157064304 |  |
| 331000000.0 | 99231303598000000 | 99943952984689200 |  |
| 331250000.0 | 99306251712500000 | 100018583289696000 |  |
| 331500000.0 | 99381199827000000 | 100093214071012992 |  |
| 331750000.0 | 99456147941500000 | 100167845327572000 |  |
| 332000000.0 | 99531096056000000 | 100242477058311008 |  |
| 332250000.0 | 99606044170500000 | 100317109262166000 |  |
| 332500000.0 | 99680992285000000 | 100391741938080000 |  |
| 332750000.0 | 99755940399500000 | 100466375084996992 |  |
| 333000000.0 | 99830888514000000 | 100541008701866000 |  |
| 333250000.0 | 99905836628500000 | 100615642787639008 |  |
| 333500000.0 | 99980784743000000 | 100690277341268000 |  |
| 333750000.0 | 100055732857500000 | 100764912361712000 |  |
| 334000000.0 | 100130680972000000 | 100839547847931008 |  |
| 334250000.0 | 100205629086500000 | 100914183798888992 |  |
| 334500000.0 | 100280577201000000 | 100988820213552000 |  |
| 334750000.0 | 100355525315500000 | 101063457090890000 |  |
| 335000000.0 | 100430473430000000 | 101138094429876000 |  |
| 335250000.0 | 100505421544500000 | 101212732229486000 |  |
| 335500000.0 | 100580369659000000 | 101287370488698000 |  |
| 335750000.0 | 100655317773500000 | 101362009206494000 |  |
| 336000000.0 | 100730265888000000 | 101436648381859008 |  |
| 336250000.0 | 100805214002500000 | 101511288013780000 |  |
| 336500000.0 | 100880162117000000 | 101585928101248992 |  |
| 336750000.0 | 100955110231500000 | 101660568643259008 |  |
| 337000000.0 | 101030058346000000 | 101735209638808000 |  |
| 337250000.0 | 101105006460500000 | 101809851086892992 |  |
| 337500000.0 | 101179954575000000 | 101884492986519008 |  |
| 337750000.0 | 101254902689500000 | 101959135336690000 |  |
| 338000000.0 | 101329850804000000 | 102033778136416000 |  |
| 338250000.0 | 101404798918500000 | 102108421384706000 |  |
| 338500000.0 | 101479747033000000 | 102183065080576000 |  |
| 338750000.0 | 101554695147500000 | 102257709223043008 |  |
| 339000000.0 | 101629643262000000 | 102332353811126000 |  |
| 339250000.0 | 101704591376500000 | 102406998843848000 |  |
| 339500000.0 | 101779539491000000 | 102481644320236000 |  |
| 339750000.0 | 101854487605500000 | 102556290239316992 |  |
| 340000000.0 | 101929435720000000 | 102630936600122000 |  |
| 340250000.0 | 102004383834500000 | 102705583401687008 |  |
| 340500000.0 | 102079331949000000 | 102780230643047008 |  |
| 340750000.0 | 102154280063500000 | 102854878323243008 |  |
| 341000000.0 | 102229228178000000 | 102929526441316992 |  |
| 341250000.0 | 102304176292500000 | 103004174996314000 |  |
| 341500000.0 | 102379124407000000 | 103078823987283008 |  |
| 341750000.0 | 102454072521500000 | 103153473413274000 |  |
| 342000000.0 | 102529020636000000 | 103228123273340992 |  |
| 342250000.0 | 102603968750500000 | 103302773566540992 |  |
| 342500000.0 | 102678916865000000 | 103377424291932000 |  |
| 342750000.0 | 102753864979500000 | 103452075448576000 |  |
| 343000000.0 | 102828813094000000 | 103526727035536992 |  |
| 343250000.0 | 102903761208500000 | 103601379051883008 |  |
| 343500000.0 | 102978709323000000 | 103676031496684000 |  |
| 343750000.0 | 103053657437500000 | 103750684369012000 |  |
| 344000000.0 | 103128605552000000 | 103825337667942000 |  |
| 344250000.0 | 103203553666500000 | 103899991392552000 |  |
| 344500000.0 | 103278501781000000 | 103974645541923008 |  |
| 344750000.0 | 103353449895500000 | 104049300115138000 |  |
| 345000000.0 | 103428398010000000 | 104123955111283008 |  |
| 345250000.0 | 103503346124500000 | 104198610529446000 |  |
| 345500000.0 | 103578294239000000 | 104273266368718000 |  |
| 345750000.0 | 103653242353500000 | 104347922628192992 |  |
| 346000000.0 | 103728190468000000 | 104422579306967008 |  |
| 346250000.0 | 103803138582500000 | 104497236404138000 |  |
| 346500000.0 | 103878086697000000 | 104571893918808992 |  |
| 346750000.0 | 103953034811500000 | 104646551850083008 |  |
| 347000000.0 | 104027982926000000 | 104721210197067008 |  |
| 347250000.0 | 104102931040500000 | 104795868958868992 |  |
| 347500000.0 | 104177879155000000 | 104870528134602000 |  |
| 347750000.0 | 104252827269500000 | 104945187723379008 |  |
| 348000000.0 | 104327775384000000 | 105019847724316992 |  |
| 348250000.0 | 104402723498500000 | 105094508136536000 |  |
| 348500000.0 | 104477671613000000 | 105169168959156992 |  |
| 348750000.0 | 104552619727500000 | 105243830191303008 |  |
| 349000000.0 | 104627567842000000 | 105318491832103008 |  |
| 349250000.0 | 104702515956500000 | 105393153880684000 |  |
| 349500000.0 | 104777464071000000 | 105467816336180000 |  |
| 349750000.0 | 104852412185500000 | 105542479197720992 |  |
| 350000000.0 | 104927360300000000 | 105617142464448000 |  |
| 350250000.0 | 105002308414500000 | 105691806135496992 |  |
| 350500000.0 | 105077256529000000 | 105766470210011008 |  |
| 350750000.0 | 105152204643500000 | 105841134687132992 |  |
| 351000000.0 | 105227152758000000 | 105915799566008992 |  |
| 351250000.0 | 105302100872500000 | 105990464845788000 |  |
| 351500000.0 | 105377048987000000 | 106065130525620992 |  |
| 351750000.0 | 105451997101500000 | 106139796604662000 |  |
| 352000000.0 | 105526945216000000 | 106214463082066000 |  |
| 352250000.0 | 105601893330500000 | 106289129956991008 |  |
| 352500000.0 | 105676841445000000 | 106363797228599008 |  |
| 352750000.0 | 105751789559500000 | 106438464896051008 |  |
| 353000000.0 | 105826737674000000 | 106513132958512992 |  |
| 353250000.0 | 105901685788500000 | 106587801415152992 |  |
| 353500000.0 | 105976633903000000 | 106662470265140000 |  |
| 353750000.0 | 106051582017500000 | 106737139507648000 |  |
| 354000000.0 | 106126530132000000 | 106811809141848992 |  |
| 354250000.0 | 106201478246500000 | 106886479166922000 |  |
| 354500000.0 | 106276426361000000 | 106961149582046000 |  |
| 354750000.0 | 106351374475500000 | 107035820386400992 |  |
| 355000000.0 | 106426322590000000 | 107110491579172000 |  |
| 355250000.0 | 106501270704500000 | 107185163159544992 |  |
| 355500000.0 | 106576218819000000 | 107259835126708000 |  |
| 355750000.0 | 106651166933500000 | 107334507479851008 |  |
| 356000000.0 | 106726115048000000 | 107409180218167008 |  |
| 356250000.0 | 106801063162500000 | 107483853340852000 |  |
| 356500000.0 | 106876011277000000 | 107558526847102000 |  |
| 356750000.0 | 106950959391500000 | 107633200736118000 |  |
| 357000000.0 | 107025907506000000 | 107707875007100992 |  |
| 357250000.0 | 107100855620500000 | 107782549659254000 |  |
| 357500000.0 | 107175803735000000 | 107857224691784992 |  |
| 357750000.0 | 107250751849500000 | 107931900103900992 |  |
| 358000000.0 | 107325699964000000 | 108006575894812000 |  |
| 358250000.0 | 107400648078500000 | 108081252063732992 |  |
| 358500000.0 | 107475596193000000 | 108155928609876992 |  |
| 358750000.0 | 107550544307500000 | 108230605532462000 |  |
| 359000000.0 | 107625492422000000 | 108305282830706000 |  |
| 359250000.0 | 107700440536500000 | 108379960503832000 |  |
| 359500000.0 | 107775388651000000 | 108454638551063008 |  |
| 359750000.0 | 107850336765500000 | 108529316971624000 |  |
| 360000000.0 | 107925284880000000 | 108603995764744000 |  |
| 360250000.0 | 108000232994500000 | 108678674929652000 |  |
| 360500000.0 | 108075181109000000 | 108753354465580000 |  |
| 360750000.0 | 108150129223500000 | 108828034371762000 |  |
| 361000000.0 | 108225077338000000 | 108902714647436000 |  |
| 361250000.0 | 108300025452500000 | 108977395291838000 |  |
| 361500000.0 | 108374973567000000 | 109052076304210000 |  |
| 361750000.0 | 108449921681500000 | 109126757683794000 |  |
| 362000000.0 | 108524869796000000 | 109201439429835008 |  |
| 362250000.0 | 108599817910500000 | 109276121541579008 |  |
| 362500000.0 | 108674766025000000 | 109350804018275008 |  |
| 362750000.0 | 108749714139500000 | 109425486859174000 |  |
| 363000000.0 | 108824662254000000 | 109500170063528000 |  |
| 363250000.0 | 108899610368500000 | 109574853630592992 |  |
| 363500000.0 | 108974558483000000 | 109649537559626000 |  |
| 363750000.0 | 109049506597500000 | 109724221849884000 |  |
| 364000000.0 | 109124454712000000 | 109798906500631008 |  |
| 364250000.0 | 109199402826500000 | 109873591511127008 |  |
| 364500000.0 | 109274350941000000 | 109948276880639008 |  |
| 364750000.0 | 109349299055500000 | 110022962608432000 |  |
| 365000000.0 | 109424247170000000 | 110097648693776992 |  |
| 365250000.0 | 109499195284500000 | 110172335135944000 |  |
| 365500000.0 | 109574143399000000 | 110247021934206000 |  |
| 365750000.0 | 109649091513500000 | 110321709087836992 |  |
| 366000000.0 | 109724039628000000 | 110396396596115008 |  |
| 366250000.0 | 109798987742500000 | 110471084458319008 |  |
| 366500000.0 | 109873935857000000 | 110545772673728992 |  |
| 366750000.0 | 109948883971500000 | 110620461241628000 |  |
| 367000000.0 | 110023832086000000 | 110695150161300000 |  |
| 367250000.0 | 110098780200500000 | 110769839432032000 |  |
| 367500000.0 | 110173728315000000 | 110844529053112992 |  |
| 367750000.0 | 110248676429500000 | 110919219023832992 |  |
| 368000000.0 | 110323624544000000 | 110993909343484000 |  |
| 368250000.0 | 110398572658500000 | 111068600011360992 |  |
| 368500000.0 | 110473520773000000 | 111143291026759008 |  |
| 368750000.0 | 110548468887500000 | 111217982388976992 |  |
| 369000000.0 | 110623417002000000 | 111292674097314000 |  |
| 369250000.0 | 110698365116500000 | 111367366151072992 |  |
| 369500000.0 | 110773313231000000 | 111442058549556992 |  |
| 369750000.0 | 110848261345500000 | 111516751292071008 |  |
| 370000000.0 | 110923209460000000 | 111591444377923008 |  |
| 370250000.0 | 110998157574500000 | 111666137806422000 |  |
| 370500000.0 | 111073105689000000 | 111740831576880000 |  |
| 370750000.0 | 111148053803500000 | 111815525688608000 |  |
| 371000000.0 | 111223001918000000 | 111890220140922000 |  |
| 371250000.0 | 111297950032500000 | 111964914933139008 |  |
| 371500000.0 | 111372898147000000 | 112039610064576992 |  |
| 371750000.0 | 111447846261500000 | 112114305534556000 |  |
| 372000000.0 | 111522794376000000 | 112189001342398000 |  |
| 372250000.0 | 111597742490500000 | 112263697487427008 |  |
| 372500000.0 | 111672690605000000 | 112338393968968000 |  |
| 372750000.0 | 111747638719500000 | 112413090786350000 |  |
| 373000000.0 | 111822586834000000 | 112487787938900992 |  |
| 373250000.0 | 111897534948500000 | 112562485425952992 |  |
| 373500000.0 | 111972483063000000 | 112637183246836992 |  |
| 373750000.0 | 112047431177500000 | 112711881400890000 |  |
| 374000000.0 | 112122379292000000 | 112786579887446000 |  |
| 374250000.0 | 112197327406500000 | 112861278705844000 |  |
| 374500000.0 | 112272275521000000 | 112935977855424992 |  |
| 374750000.0 | 112347223635500000 | 113010677335528992 |  |
| 375000000.0 | 112422171750000000 | 113085377145500000 |  |
| 375250000.0 | 112497119864500000 | 113160077284683008 |  |
| 375500000.0 | 112572067979000000 | 113234777752424000 |  |
| 375750000.0 | 112647016093500000 | 113309478548072992 |  |
| 376000000.0 | 112721964208000000 | 113384179670980000 |  |
| 376250000.0 | 112796912322500000 | 113458881120496000 |  |
| 376500000.0 | 112871860437000000 | 113533582895975008 |  |
| 376750000.0 | 112946808551500000 | 113608284996772000 |  |
| 377000000.0 | 113021756666000000 | 113682987422244992 |  |
| 377250000.0 | 113096704780500000 | 113757690171752000 |  |
| 377500000.0 | 113171652895000000 | 113832393244654000 |  |
| 377750000.0 | 113246601009500000 | 113907096640312000 |  |
| 378000000.0 | 113321549124000000 | 113981800358091008 |  |
| 378250000.0 | 113396497238500000 | 114056504397356992 |  |
| 378500000.0 | 113471445353000000 | 114131208757475008 |  |
| 378750000.0 | 113546393467500000 | 114205913437815008 |  |
| 379000000.0 | 113621341582000000 | 114280618437748000 |  |
| 379250000.0 | 113696289696500000 | 114355323756644000 |  |
| 379500000.0 | 113771237811000000 | 114430029393879008 |  |
| 379750000.0 | 113846185925500000 | 114504735348828000 |  |
| 380000000.0 | 113921134040000000 | 114579441620867008 |  |
| 380250000.0 | 113996082154500000 | 114654148209374000 |  |
| 380500000.0 | 114071030269000000 | 114728855113732000 |  |
| 380750000.0 | 114145978383500000 | 114803562333320000 |  |
| 381000000.0 | 114220926498000000 | 114878269867522000 |  |
| 381250000.0 | 114295874612500000 | 114952977715724992 |  |
| 381500000.0 | 114370822727000000 | 115027685877312992 |  |
| 381750000.0 | 114445770841500000 | 115102394351676000 |  |
| 382000000.0 | 114520718956000000 | 115177103138203008 |  |
| 382250000.0 | 114595667070500000 | 115251812236286000 |  |
| 382500000.0 | 114670615185000000 | 115326521645316992 |  |
| 382750000.0 | 114745563299500000 | 115401231364692000 |  |
| 383000000.0 | 114820511414000000 | 115475941393806000 |  |
| 383250000.0 | 114895459528500000 | 115550651732058000 |  |
| 383500000.0 | 114970407643000000 | 115625362378844992 |  |
| 383750000.0 | 115045355757500000 | 115700073333570000 |  |
| 384000000.0 | 115120303872000000 | 115774784595634000 |  |
| 384250000.0 | 115195251986500000 | 115849496164442000 |  |
| 384500000.0 | 115270200101000000 | 115924208039399008 |  |
| 384750000.0 | 115345148215500000 | 115998920219911008 |  |
| 385000000.0 | 115420096330000000 | 116073632705388000 |  |
| 385250000.0 | 115495044444500000 | 116148345495239008 |  |
| 385500000.0 | 115569992559000000 | 116223058588876000 |  |
| 385750000.0 | 115644940673500000 | 116297771985712000 |  |
| 386000000.0 | 115719888788000000 | 116372485685160992 |  |
| 386250000.0 | 115794836902500000 | 116447199686640000 |  |
| 386500000.0 | 115869785017000000 | 116521913989566000 |  |
| 386750000.0 | 115944733131500000 | 116596628593358000 |  |
| 387000000.0 | 116019681246000000 | 116671343497436992 |  |
| 387250000.0 | 116094629360500000 | 116746058701224992 |  |
| 387500000.0 | 116169577475000000 | 116820774204144992 |  |
| 387750000.0 | 116244525589500000 | 116895490005622000 |  |
| 388000000.0 | 116319473704000000 | 116970206105084000 |  |
| 388250000.0 | 116394421818500000 | 117044922501956000 |  |
| 388500000.0 | 116469369933000000 | 117119639195670000 |  |
| 388750000.0 | 116544318047500000 | 117194356185656000 |  |
| 389000000.0 | 116619266162000000 | 117269073471346000 |  |
| 389250000.0 | 116694214276500000 | 117343791052174000 |  |
| 389500000.0 | 116769162391000000 | 117418508927575008 |  |
| 389750000.0 | 116844110505500000 | 117493227096986000 |  |
| 390000000.0 | 116919058620000000 | 117567945559844000 |  |
| 390250000.0 | 116994006734500000 | 117642664315590000 |  |
| 390500000.0 | 117068954849000000 | 117717383363664000 |  |
| 390750000.0 | 117143902963500000 | 117792102703508992 |  |
| 391000000.0 | 117218851078000000 | 117866822334568000 |  |
| 391250000.0 | 117293799192500000 | 117941542256286000 |  |
| 391500000.0 | 117368747307000000 | 118016262468111008 |  |
| 391750000.0 | 117443695421500000 | 118090982969488992 |  |
| 392000000.0 | 117518643536000000 | 118165703759871008 |  |
| 392250000.0 | 117593591650500000 | 118240424838707008 |  |
| 392500000.0 | 117668539765000000 | 118315146205448992 |  |
| 392750000.0 | 117743487879500000 | 118389867859550000 |  |
| 393000000.0 | 117818435994000000 | 118464589800467008 |  |
| 393250000.0 | 117893384108500000 | 118539312027654000 |  |
| 393500000.0 | 117968332223000000 | 118614034540570000 |  |
| 393750000.0 | 118043280337500000 | 118688757338674000 |  |
| 394000000.0 | 118118228452000000 | 118763480421426000 |  |
| 394250000.0 | 118193176566500000 | 118838203788287008 |  |
| 394500000.0 | 118268124681000000 | 118912927438720992 |  |
| 394750000.0 | 118343072795500000 | 118987651372192992 |  |
| 395000000.0 | 118418020910000000 | 119062375588168000 |  |
| 395250000.0 | 118492969024500000 | 119137100086112992 |  |
| 395500000.0 | 118567917139000000 | 119211824865496000 |  |
| 395750000.0 | 118642865253500000 | 119286549925788992 |  |
| 396000000.0 | 118717813368000000 | 119361275266460992 |  |
| 396250000.0 | 118792761482500000 | 119436000886984992 |  |
| 396500000.0 | 118867709597000000 | 119510726786835008 |  |
| 396750000.0 | 118942657711500000 | 119585452965486000 |  |
| 397000000.0 | 119017605826000000 | 119660179422414000 |  |
| 397250000.0 | 119092553940500000 | 119734906157096992 |  |
| 397500000.0 | 119167502055000000 | 119809633169015008 |  |
| 397750000.0 | 119242450169500000 | 119884360457647008 |  |
| 398000000.0 | 119317398284000000 | 119959088022475008 |  |
| 398250000.0 | 119392346398500000 | 120033815862982000 |  |
| 398500000.0 | 119467294513000000 | 120108543978652992 |  |
| 398750000.0 | 119542242627500000 | 120183272368972000 |  |
| 399000000.0 | 119617190742000000 | 120258001033426000 |  |
| 399250000.0 | 119692138856500000 | 120332729971504000 |  |
| 399500000.0 | 119767086971000000 | 120407459182695008 |  |
| 399750000.0 | 119842035085500000 | 120482188666488992 |  |
| 400000000.0 | 119916983200000000 | 120556918422379008 |  |
| 400250000.0 | 119991931314500000 | 120631648449856992 |  |
| 400500000.0 | 120066879429000000 | 120706378748416992 |  |
| 400750000.0 | 120141827543500000 | 120781109317556000 |  |
| 401000000.0 | 120216775658000000 | 120855840156768992 |  |
| 401250000.0 | 120291723772500000 | 120930571265556992 |  |
| 401500000.0 | 120366671887000000 | 121005302643416000 |  |
| 401750000.0 | 120441620001500000 | 121080034289848992 |  |
| 402000000.0 | 120516568116000000 | 121154766204356992 |  |
| 402250000.0 | 120591516230500000 | 121229498386443008 |  |
| 402500000.0 | 120666464345000000 | 121304230835612000 |  |
| 402750000.0 | 120741412459500000 | 121378963551368000 |  |
| 403000000.0 | 120816360574000000 | 121453696533218000 |  |
| 403250000.0 | 120891308688500000 | 121528429780672000 |  |
| 403500000.0 | 120966256803000000 | 121603163293236000 |  |
| 403750000.0 | 121041204917500000 | 121677897070423008 |  |
| 404000000.0 | 121116153032000000 | 121752631111743008 |  |
| 404250000.0 | 121191101146500000 | 121827365416710000 |  |
| 404500000.0 | 121266049261000000 | 121902099984836992 |  |
| 404750000.0 | 121340997375500000 | 121976834815639008 |  |
| 405000000.0 | 121415945490000000 | 122051569908632992 |  |
| 405250000.0 | 121490893604500000 | 122126305263335008 |  |
| 405500000.0 | 121565841719000000 | 122201040879266000 |  |
| 405750000.0 | 121640789833500000 | 122275776755944992 |  |
| 406000000.0 | 121715737948000000 | 122350512892892000 |  |
| 406250000.0 | 121790686062500000 | 122425249289630000 |  |
| 406500000.0 | 121865634177000000 | 122499985945683008 |  |
| 406750000.0 | 121940582291500000 | 122574722860575008 |  |
| 407000000.0 | 122015530406000000 | 122649460033831008 |  |
| 407250000.0 | 122090478520500000 | 122724197464979008 |  |
| 407500000.0 | 122165426635000000 | 122798935153546000 |  |
| 407750000.0 | 122240374749500000 | 122873673099062000 |  |
| 408000000.0 | 122315322864000000 | 122948411301056992 |  |
| 408250000.0 | 122390270978500000 | 123023149759063008 |  |
| 408500000.0 | 122465219093000000 | 123097888472611008 |  |
| 408750000.0 | 122540167207500000 | 123172627441236000 |  |
| 409000000.0 | 122615115322000000 | 123247366664472992 |  |
| 409250000.0 | 122690063436500000 | 123322106141856992 |  |
| 409500000.0 | 122765011551000000 | 123396845872927008 |  |
| 409750000.0 | 122839959665500000 | 123471585857219008 |  |
| 410000000.0 | 122914907780000000 | 123546326094272992 |  |
| 410250000.0 | 122989855894500000 | 123621066583630000 |  |
| 410500000.0 | 123064804009000000 | 123695807324832000 |  |
| 410750000.0 | 123139752123500000 | 123770548317420992 |  |
| 411000000.0 | 123214700238000000 | 123845289560940000 |  |
| 411250000.0 | 123289648352500000 | 123920031054935008 |  |
| 411500000.0 | 123364596467000000 | 123994772798952000 |  |
| 411750000.0 | 123439544581500000 | 124069514792538000 |  |
| 412000000.0 | 123514492696000000 | 124144257035240992 |  |
| 412250000.0 | 123589440810500000 | 124218999526610000 |  |
| 412500000.0 | 123664388925000000 | 124293742266196000 |  |
| 412750000.0 | 123739337039500000 | 124368485253548992 |  |
| 413000000.0 | 123814285154000000 | 124443228488224000 |  |
| 413250000.0 | 123889233268500000 | 124517971969772000 |  |
| 413500000.0 | 123964181383000000 | 124592715697750000 |  |
| 413750000.0 | 124039129497500000 | 124667459671712000 |  |
| 414000000.0 | 124114077612000000 | 124742203891215008 |  |
| 414250000.0 | 124189025726500000 | 124816948355818000 |  |
| 414500000.0 | 124263973841000000 | 124891693065078000 |  |
| 414750000.0 | 124338921955500000 | 124966438018556992 |  |
| 415000000.0 | 124413870070000000 | 125041183215815008 |  |
| 415250000.0 | 124488818184500000 | 125115928656414000 |  |
| 415500000.0 | 124563766299000000 | 125190674339918000 |  |
| 415750000.0 | 124638714413500000 | 125265420265890000 |  |
| 416000000.0 | 124713662528000000 | 125340166433896000 |  |
| 416250000.0 | 124788610642500000 | 125414912843502000 |  |
| 416500000.0 | 124863558757000000 | 125489659494275008 |  |
| 416750000.0 | 124938506871500000 | 125564406385783008 |  |
| 417000000.0 | 125013454986000000 | 125639153517596992 |  |
| 417250000.0 | 125088403100500000 | 125713900889286000 |  |
| 417500000.0 | 125163351215000000 | 125788648500420992 |  |
| 417750000.0 | 125238299329500000 | 125863396350576000 |  |
| 418000000.0 | 125313247444000000 | 125938144439323008 |  |
| 418250000.0 | 125388195558500000 | 126012892766236992 |  |
| 418500000.0 | 125463143673000000 | 126087641330894000 |  |
| 418750000.0 | 125538091787500000 | 126162390132868992 |  |
| 419000000.0 | 125613039902000000 | 126237139171740992 |  |
| 419250000.0 | 125687988016500000 | 126311888447088000 |  |
| 419500000.0 | 125762936131000000 | 126386637958488000 |  |
| 419750000.0 | 125837884245500000 | 126461387705524000 |  |
| 420000000.0 | 125912832360000000 | 126536137687775008 |  |
| 420250000.0 | 125987780474500000 | 126610887904824992 |  |
| 420500000.0 | 126062728589000000 | 126685638356258000 |  |
| 420750000.0 | 126137676703500000 | 126760389041656000 |  |
| 421000000.0 | 126212624818000000 | 126835139960606000 |  |
| 421250000.0 | 126287572932500000 | 126909891112695008 |  |
| 421500000.0 | 126362521047000000 | 126984642497508992 |  |
| 421750000.0 | 126437469161500000 | 127059394114636992 |  |
| 422000000.0 | 126512417276000000 | 127134145963667008 |  |
| 422250000.0 | 126587365390500000 | 127208898044192000 |  |
| 422500000.0 | 126662313505000000 | 127283650355800000 |  |
| 422750000.0 | 126737261619500000 | 127358402898086000 |  |
| 423000000.0 | 126812209734000000 | 127433155670640992 |  |
| 423250000.0 | 126887157848500000 | 127507908673060000 |  |
| 423500000.0 | 126962105963000000 | 127582661904938000 |  |
| 423750000.0 | 127037054077500000 | 127657415365871008 |  |
| 424000000.0 | 127112002192000000 | 127732169055456000 |  |
| 424250000.0 | 127186950306500000 | 127806922973291008 |  |
| 424500000.0 | 127261898421000000 | 127881677118974000 |  |
| 424750000.0 | 127336846535500000 | 127956431492106000 |  |
| 425000000.0 | 127411794650000000 | 128031186092286000 |  |
| 425250000.0 | 127486742764500000 | 128105940919116992 |  |
| 425500000.0 | 127561690879000000 | 128180695972202000 |  |
| 425750000.0 | 127636638993500000 | 128255451251143008 |  |
| 426000000.0 | 127711587108000000 | 128330206755544992 |  |
| 426250000.0 | 127786535222500000 | 128404962485012992 |  |
| 426500000.0 | 127861483337000000 | 128479718439155008 |  |
| 426750000.0 | 127936431451500000 | 128554474617576000 |  |
| 427000000.0 | 128011379566000000 | 128629231019884992 |  |
| 427250000.0 | 128086327680500000 | 128703987645690000 |  |
| 427500000.0 | 128161275795000000 | 128778744494603008 |  |
| 427750000.0 | 128236223909500000 | 128853501566232992 |  |
| 428000000.0 | 128311172024000000 | 128928258860192992 |  |
| 428250000.0 | 128386120138500000 | 129003016376094000 |  |
| 428500000.0 | 128461068253000000 | 129077774113551008 |  |
| 428750000.0 | 128536016367500000 | 129152532072178000 |  |
| 429000000.0 | 128610964482000000 | 129227290251590000 |  |
| 429250000.0 | 128685912596500000 | 129302048651403008 |  |
| 429500000.0 | 128760860711000000 | 129376807271234000 |  |
| 429750000.0 | 128835808825500000 | 129451566110702000 |  |
| 430000000.0 | 128910756940000000 | 129526325169424992 |  |
| 430250000.0 | 128985705054500000 | 129601084447023008 |  |
| 430500000.0 | 129060653169000000 | 129675843943116992 |  |
| 430750000.0 | 129135601283500000 | 129750603657327008 |  |
| 431000000.0 | 129210549398000000 | 129825363589276992 |  |
| 431250000.0 | 129285497512500000 | 129900123738590000 |  |
| 431500000.0 | 129360445627000000 | 129974884104888992 |  |
| 431750000.0 | 129435393741500000 | 130049644687799008 |  |
| 432000000.0 | 129510341856000000 | 130124405486948000 |  |
| 432250000.0 | 129585289970500000 | 130199166501960000 |  |
| 432500000.0 | 129660238085000000 | 130273927732464000 |  |
| 432750000.0 | 129735186199500000 | 130348689178088000 |  |
| 433000000.0 | 129810134314000000 | 130423450838460992 |  |
| 433250000.0 | 129885082428500000 | 130498212713212992 |  |
| 433500000.0 | 129960030543000000 | 130572974801976000 |  |
| 433750000.0 | 130034978657500000 | 130647737104380992 |  |
| 434000000.0 | 130109926772000000 | 130722499620060992 |  |
| 434250000.0 | 130184874886500000 | 130797262348648992 |  |
| 434500000.0 | 130259823001000000 | 130872025289779008 |  |
| 434750000.0 | 130334771115500000 | 130946788443087008 |  |
| 435000000.0 | 130409719230000000 | 131021551808208000 |  |
| 435250000.0 | 130484667344500000 | 131096315384780992 |  |
| 435500000.0 | 130559615459000000 | 131171079172440992 |  |
| 435750000.0 | 130634563573500000 | 131245843170827008 |  |
| 436000000.0 | 130709511688000000 | 131320607379580000 |  |
| 436250000.0 | 130784459802500000 | 131395371798338000 |  |
| 436500000.0 | 130859407917000000 | 131470136426743008 |  |
| 436750000.0 | 130934356031500000 | 131544901264436992 |  |
| 437000000.0 | 131009304146000000 | 131619666311062000 |  |
| 437250000.0 | 131084252260500000 | 131694431566262000 |  |
| 437500000.0 | 131159200375000000 | 131769197029680000 |  |
| 437750000.0 | 131234148489500000 | 131843962700962000 |  |
| 438000000.0 | 131309096604000000 | 131918728579754000 |  |
| 438250000.0 | 131384044718500000 | 131993494665702000 |  |
| 438500000.0 | 131458992833000000 | 132068260958452992 |  |
| 438750000.0 | 131533940947500000 | 132143027457656000 |  |
| 439000000.0 | 131608889062000000 | 132217794162960000 |  |
| 439250000.0 | 131683837176500000 | 132292561074014000 |  |
| 439500000.0 | 131758785291000000 | 132367328190468992 |  |
| 439750000.0 | 131833733405500000 | 132442095511976992 |  |
| 440000000.0 | 131908681520000000 | 132516863038190000 |  |
| 440250000.0 | 131983629634500000 | 132591630768760000 |  |
| 440500000.0 | 132058577749000000 | 132666398703340992 |  |
| 440750000.0 | 132133525863500000 | 132741166841588000 |  |
| 441000000.0 | 132208473978000000 | 132815935183156000 |  |
| 441250000.0 | 132283422092500000 | 132890703727702000 |  |
| 441500000.0 | 132358370207000000 | 132965472474880992 |  |
| 441750000.0 | 132433318321500000 | 133040241424352992 |  |
| 442000000.0 | 132508266436000000 | 133115010575774000 |  |
| 442250000.0 | 132583214550500000 | 133189779928804000 |  |
| 442500000.0 | 132658162665000000 | 133264549483104000 |  |
| 442750000.0 | 132733110779500000 | 133339319238332992 |  |
| 443000000.0 | 132808058894000000 | 133414089194152992 |  |
| 443250000.0 | 132883007008500000 | 133488859350227008 |  |
| 443500000.0 | 132957955123000000 | 133563629706216992 |  |
| 443750000.0 | 133032903237500000 | 133638400261787008 |  |
| 444000000.0 | 133107851352000000 | 133713171016602000 |  |
| 444250000.0 | 133182799466500000 | 133787941970327008 |  |
| 444500000.0 | 133257747581000000 | 133862713122627008 |  |
| 444750000.0 | 133332695695500000 | 133937484473170000 |  |
| 445000000.0 | 133407643810000000 | 134012256021622000 |  |
| 445250000.0 | 133482591924500000 | 134087027767652992 |  |
| 445500000.0 | 133557540039000000 | 134161799710931008 |  |
| 445750000.0 | 133632488153500000 | 134236571851124992 |  |
| 446000000.0 | 133707436268000000 | 134311344187907008 |  |
| 446250000.0 | 133782384382500000 | 134386116720947008 |  |
| 446500000.0 | 133857332497000000 | 134460889449916992 |  |
| 446750000.0 | 133932280611500000 | 134535662374488992 |  |
| 447000000.0 | 134007228726000000 | 134610435494338000 |  |
| 447250000.0 | 134082176840500000 | 134685208809136992 |  |
| 447500000.0 | 134157124955000000 | 134759982318560992 |  |
| 447750000.0 | 134232073069500000 | 134834756022286000 |  |
| 448000000.0 | 134307021184000000 | 134909529919987008 |  |
| 448250000.0 | 134381969298500000 | 134984304011342000 |  |
| 448500000.0 | 134456917413000000 | 135059078296028000 |  |
| 448750000.0 | 134531865527500000 | 135133852773723008 |  |
| 449000000.0 | 134606813642000000 | 135208627444108000 |  |
| 449250000.0 | 134681761756500000 | 135283402306860992 |  |
| 449500000.0 | 134756709871000000 | 135358177361663008 |  |
| 449750000.0 | 134831657985500000 | 135432952608196000 |  |
| 450000000.0 | 134906606100000000 | 135507728046140992 |  |
| 450250000.0 | 134981554214500000 | 135582503675180000 |  |
| 450500000.0 | 135056502329000000 | 135657279494998000 |  |
| 450750000.0 | 135131450443500000 | 135732055505278000 |  |
| 451000000.0 | 135206398558000000 | 135806831705704992 |  |
| 451250000.0 | 135281346672500000 | 135881608095964000 |  |
| 451500000.0 | 135356294787000000 | 135956384675742000 |  |
| 451750000.0 | 135431242901500000 | 136031161444724992 |  |
| 452000000.0 | 135506191016000000 | 136105938402600992 |  |
| 452250000.0 | 135581139130500000 | 136180715549056992 |  |
| 452500000.0 | 135656087245000000 | 136255492883784000 |  |
| 452750000.0 | 135731035359500000 | 136330270406468992 |  |
| 453000000.0 | 135805983474000000 | 136405048116804000 |  |
| 453250000.0 | 135880931588500000 | 136479826014480000 |  |
| 453500000.0 | 135955879703000000 | 136554604099187008 |  |
| 453750000.0 | 136030827817500000 | 136629382370619008 |  |
| 454000000.0 | 136105775932000000 | 136704160828468000 |  |
| 454250000.0 | 136180724046500000 | 136778939472428000 |  |
| 454500000.0 | 136255672161000000 | 136853718302192992 |  |
| 454750000.0 | 136330620275500000 | 136928497317458000 |  |
| 455000000.0 | 136405568390000000 | 137003276517918000 |  |
| 455250000.0 | 136480516504500000 | 137078055903270000 |  |
| 455500000.0 | 136555464619000000 | 137152835473212000 |  |
| 455750000.0 | 136630412733500000 | 137227615227439008 |  |
| 456000000.0 | 136705360848000000 | 137302395165651008 |  |
| 456250000.0 | 136780308962500000 | 137377175287547008 |  |
| 456500000.0 | 136855257077000000 | 137451955592826000 |  |
| 456750000.0 | 136930205191500000 | 137526736081188992 |  |
| 457000000.0 | 137005153306000000 | 137601516752335008 |  |
| 457250000.0 | 137080101420500000 | 137676297605968000 |  |
| 457500000.0 | 137155049535000000 | 137751078641788000 |  |
| 457750000.0 | 137229997649500000 | 137825859859499008 |  |
| 458000000.0 | 137304945764000000 | 137900641258804000 |  |
| 458250000.0 | 137379893878500000 | 137975422839408000 |  |
| 458500000.0 | 137454841993000000 | 138050204601015008 |  |
| 458750000.0 | 137529790107500000 | 138124986543330000 |  |
| 459000000.0 | 137604738222000000 | 138199768666060000 |  |
| 459250000.0 | 137679686336500000 | 138274550968911008 |  |
| 459500000.0 | 137754634451000000 | 138349333451591008 |  |
| 459750000.0 | 137829582565500000 | 138424116113807008 |  |
| 460000000.0 | 137904530680000000 | 138498898955268000 |  |
| 460250000.0 | 137979478794500000 | 138573681975683008 |  |
| 460500000.0 | 138054426909000000 | 138648465174763008 |  |
| 460750000.0 | 138129375023500000 | 138723248552216000 |  |
| 461000000.0 | 138204323138000000 | 138798032107756000 |  |
| 461250000.0 | 138279271252500000 | 138872815841092000 |  |
| 461500000.0 | 138354219367000000 | 138947599751939008 |  |
| 461750000.0 | 138429167481500000 | 139022383840007008 |  |
| 462000000.0 | 138504115596000000 | 139097168105012000 |  |
| 462250000.0 | 138579063710500000 | 139171952546667008 |  |
| 462500000.0 | 138654011825000000 | 139246737164687008 |  |
| 462750000.0 | 138728959939500000 | 139321521958788000 |  |
| 463000000.0 | 138803908054000000 | 139396306928684992 |  |
| 463250000.0 | 138878856168500000 | 139471092074095008 |  |
| 463500000.0 | 138953804283000000 | 139545877394735008 |  |
| 463750000.0 | 139028752397500000 | 139620662890324000 |  |
| 464000000.0 | 139103700512000000 | 139695448560579008 |  |
| 464250000.0 | 139178648626500000 | 139770234405220000 |  |
| 464500000.0 | 139253596741000000 | 139845020423966000 |  |
| 464750000.0 | 139328544855500000 | 139919806616538000 |  |
| 465000000.0 | 139403492970000000 | 139994592982656000 |  |
| 465250000.0 | 139478441084500000 | 140069379522040992 |  |
| 465500000.0 | 139553389199000000 | 140144166234416992 |  |
| 465750000.0 | 139628337313500000 | 140218953119504992 |  |
| 466000000.0 | 139703285428000000 | 140293740177028992 |  |
| 466250000.0 | 139778233542500000 | 140368527406712000 |  |
| 466500000.0 | 139853181657000000 | 140443314808280000 |  |
| 466750000.0 | 139928129771500000 | 140518102381456000 |  |
| 467000000.0 | 140003077886000000 | 140592890125967008 |  |
| 467250000.0 | 140078026000500000 | 140667678041538000 |  |
| 467500000.0 | 140152974115000000 | 140742466127896992 |  |
| 467750000.0 | 140227922229500000 | 140817254384770000 |  |
| 468000000.0 | 140302870344000000 | 140892042811886000 |  |
| 468250000.0 | 140377818458500000 | 140966831408972992 |  |
| 468500000.0 | 140452766573000000 | 141041620175760992 |  |
| 468750000.0 | 140527714687500000 | 141116409111978000 |  |
| 469000000.0 | 140602662802000000 | 141191198217355008 |  |
| 469250000.0 | 140677610916500000 | 141265987491623008 |  |
| 469500000.0 | 140752559031000000 | 141340776934512992 |  |
| 469750000.0 | 140827507145500000 | 141415566545756992 |  |
| 470000000.0 | 140902455260000000 | 141490356325088000 |  |
| 470250000.0 | 140977403374500000 | 141565146272238000 |  |
| 470500000.0 | 141052351489000000 | 141639936386940992 |  |
| 470750000.0 | 141127299603500000 | 141714726668932000 |  |
| 471000000.0 | 141202247718000000 | 141789517117944992 |  |
| 471250000.0 | 141277195832500000 | 141864307733715008 |  |
| 471500000.0 | 141352143947000000 | 141939098515978000 |  |
| 471750000.0 | 141427092061500000 | 142013889464471008 |  |
| 472000000.0 | 141502040176000000 | 142088680578931008 |  |
| 472250000.0 | 141576988290500000 | 142163471859095008 |  |
| 472500000.0 | 141651936405000000 | 142238263304700992 |  |
| 472750000.0 | 141726884519500000 | 142313054915488000 |  |
| 473000000.0 | 141801832634000000 | 142387846691195008 |  |
| 473250000.0 | 141876780748500000 | 142462638631562000 |  |
| 473500000.0 | 141951728863000000 | 142537430736328992 |  |
| 473750000.0 | 142026676977500000 | 142612223005236992 |  |
| 474000000.0 | 142101625092000000 | 142687015438027008 |  |
| 474250000.0 | 142176573206500000 | 142761808034440992 |  |
| 474500000.0 | 142251521321000000 | 142836600794222000 |  |
| 474750000.0 | 142326469435500000 | 142911393717112000 |  |
| 475000000.0 | 142401417550000000 | 142986186802855008 |  |
| 475250000.0 | 142476365664500000 | 143060980051196000 |  |
| 475500000.0 | 142551313779000000 | 143135773461878000 |  |
| 475750000.0 | 142626261893500000 | 143210567034647008 |  |
| 476000000.0 | 142701210008000000 | 143285360769248000 |  |
| 476250000.0 | 142776158122500000 | 143360154665428992 |  |
| 476500000.0 | 142851106237000000 | 143434948722934000 |  |
| 476750000.0 | 142926054351500000 | 143509742941512992 |  |
| 477000000.0 | 143001002466000000 | 143584537320912000 |  |
| 477250000.0 | 143075950580500000 | 143659331860879008 |  |
| 477500000.0 | 143150898695000000 | 143734126561164992 |  |
| 477750000.0 | 143225846809500000 | 143808921421516992 |  |
| 478000000.0 | 143300794924000000 | 143883716441686000 |  |
| 478250000.0 | 143375743038500000 | 143958511621422000 |  |
| 478500000.0 | 143450691153000000 | 144033306960476992 |  |
| 478750000.0 | 143525639267500000 | 144108102458600992 |  |
| 479000000.0 | 143600587382000000 | 144182898115547008 |  |
| 479250000.0 | 143675535496500000 | 144257693931065984 |  |
| 479500000.0 | 143750483611000000 | 144332489904912992 |  |
| 479750000.0 | 143825431725500000 | 144407286036840000 |  |
| 480000000.0 | 143900379840000000 | 144482082326600992 |  |
| 480250000.0 | 143975327954500000 | 144556878773951008 |  |
| 480500000.0 | 144050276069000000 | 144631675378646016 |  |
| 480750000.0 | 144125224183500000 | 144706472140440000 |  |
| 481000000.0 | 144200172298000000 | 144781269059088992 |  |
| 481250000.0 | 144275120412500000 | 144856066134351008 |  |
| 481500000.0 | 144350068527000000 | 144930863365980992 |  |
| 481750000.0 | 144425016641500000 | 145005660753737984 |  |
| 482000000.0 | 144499964756000000 | 145080458297380000 |  |
| 482250000.0 | 144574912870500000 | 145155255996664992 |  |
| 482500000.0 | 144649860985000000 | 145230053851352992 |  |
| 482750000.0 | 144724809099500000 | 145304851861201984 |  |
| 483000000.0 | 144799757214000000 | 145379650025972992 |  |
| 483250000.0 | 144874705328500000 | 145454448345425984 |  |
| 483500000.0 | 144949653443000000 | 145529246819323008 |  |
| 483750000.0 | 145024601557500000 | 145604045447424000 |  |
| 484000000.0 | 145099549672000000 | 145678844229492992 |  |
| 484250000.0 | 145174497786500000 | 145753643165289984 |  |
| 484500000.0 | 145249445901000000 | 145828442254580000 |  |
| 484750000.0 | 145324394015500000 | 145903241497126016 |  |
| 485000000.0 | 145399342130000000 | 145978040892692000 |  |
| 485250000.0 | 145474290244500000 | 146052840441040992 |  |
| 485500000.0 | 145549238359000000 | 146127640141940000 |  |
| 485750000.0 | 145624186473500000 | 146202439995153984 |  |
| 486000000.0 | 145699134588000000 | 146277240000447008 |  |
| 486250000.0 | 145774082702500000 | 146352040157588000 |  |
| 486500000.0 | 145849030817000000 | 146426840466340992 |  |
| 486750000.0 | 145923978931500000 | 146501640926476000 |  |
| 487000000.0 | 145998927046000000 | 146576441537759008 |  |
| 487250000.0 | 146073875160500000 | 146651242299960000 |  |
| 487500000.0 | 146148823275000000 | 146726043212844992 |  |
| 487750000.0 | 146223771389500000 | 146800844276185984 |  |
| 488000000.0 | 146298719504000000 | 146875645489751008 |  |
| 488250000.0 | 146373667618500000 | 146950446853311008 |  |
| 488500000.0 | 146448615733000000 | 147025248366636000 |  |
| 488750000.0 | 146523563847500000 | 147100050029496992 |  |
| 489000000.0 | 146598511962000000 | 147174851841665984 |  |
| 489250000.0 | 146673460076500000 | 147249653802916000 |  |
| 489500000.0 | 146748408191000000 | 147324455913016992 |  |
| 489750000.0 | 146823356305500000 | 147399258171744000 |  |
| 490000000.0 | 146898304420000000 | 147474060578868992 |  |
| 490250000.0 | 146973252534500000 | 147548863134167008 |  |
| 490500000.0 | 147048200649000000 | 147623665837412000 |  |
| 490750000.0 | 147123148763500000 | 147698468688377984 |  |
| 491000000.0 | 147198096878000000 | 147773271686841984 |  |
| 491250000.0 | 147273044992500000 | 147848074832576992 |  |
| 491500000.0 | 147347993107000000 | 147922878125361984 |  |
| 491750000.0 | 147422941221500000 | 147997681564972000 |  |
| 492000000.0 | 147497889336000000 | 148072485151184000 |  |
| 492250000.0 | 147572837450500000 | 148147288883776000 |  |
| 492500000.0 | 147647785565000000 | 148222092762524992 |  |
| 492750000.0 | 147722733679500000 | 148296896787211008 |  |
| 493000000.0 | 147797681794000000 | 148371700957612000 |  |
| 493250000.0 | 147872629908500000 | 148446505273507008 |  |
| 493500000.0 | 147947578023000000 | 148521309734676000 |  |
| 493750000.0 | 148022526137500000 | 148596114340899008 |  |
| 494000000.0 | 148097474252000000 | 148670919091956992 |  |
| 494250000.0 | 148172422366500000 | 148745723987631008 |  |
| 494500000.0 | 148247370481000000 | 148820529027702016 |  |
| 494750000.0 | 148322318595500000 | 148895334211952992 |  |
| 495000000.0 | 148397266710000000 | 148970139540164992 |  |
| 495250000.0 | 148472214824500000 | 149044945012121984 |  |
| 495500000.0 | 148547162939000000 | 149119750627606016 |  |
| 495750000.0 | 148622111053500000 | 149194556386401984 |  |
| 496000000.0 | 148697059168000000 | 149269362288292992 |  |
| 496250000.0 | 148772007282500000 | 149344168333064992 |  |
| 496500000.0 | 148846955397000000 | 149418974520500992 |  |
| 496750000.0 | 148921903511500000 | 149493780850388992 |  |
| 497000000.0 | 148996851626000000 | 149568587322512000 |  |
| 497250000.0 | 149071799740500000 | 149643393936657984 |  |
| 497500000.0 | 149146747855000000 | 149718200692612992 |  |
| 497750000.0 | 149221695969500000 | 149793007590164992 |  |
| 498000000.0 | 149296644084000000 | 149867814629100992 |  |
| 498250000.0 | 149371592198500000 | 149942621809208992 |  |
| 498500000.0 | 149446540313000000 | 150017429130276992 |  |
| 498750000.0 | 149521488427500000 | 150092236592095008 |  |
| 499000000.0 | 149596436542000000 | 150167044194451008 |  |
| 499250000.0 | 149671384656500000 | 150241851937135008 |  |
| 499500000.0 | 149746332771000000 | 150316659819936992 |  |
| 499750000.0 | 149821280885500000 | 150391467842648000 |  |
| 500000000.0 | 149896229000000000 | 150466276005059008 |  |